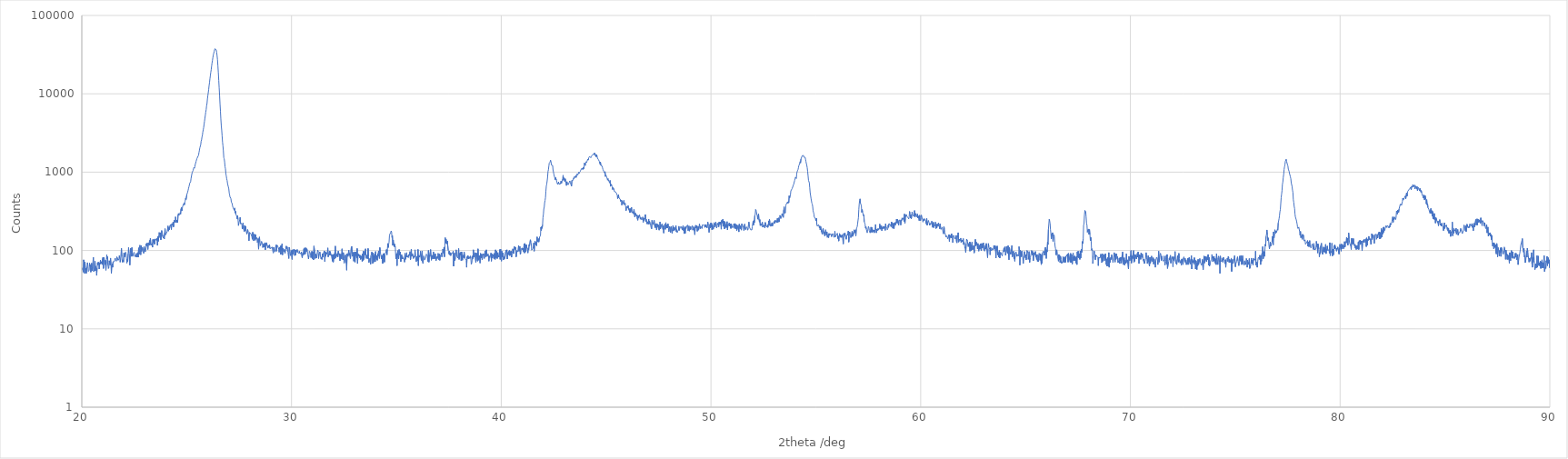
| Category | [Measurement conditions] |
|---|---|
| 20.01 | 56 |
| 20.03 | 60 |
| 20.05 | 58 |
| 20.07 | 53 |
| 20.09 | 76 |
| 20.11 | 71 |
| 20.13 | 51 |
| 20.15 | 71 |
| 20.17 | 57 |
| 20.19 | 59 |
| 20.21 | 51 |
| 20.23 | 50 |
| 20.25 | 62 |
| 20.27 | 70 |
| 20.29 | 64 |
| 20.31 | 54 |
| 20.33 | 53 |
| 20.35 | 56 |
| 20.37 | 69 |
| 20.39 | 63 |
| 20.41 | 65 |
| 20.43 | 53 |
| 20.45 | 60 |
| 20.47 | 69 |
| 20.49 | 55 |
| 20.51 | 61 |
| 20.53 | 60 |
| 20.55 | 82 |
| 20.57 | 54 |
| 20.59 | 57 |
| 20.61 | 60 |
| 20.63 | 73 |
| 20.65 | 55 |
| 20.67 | 63 |
| 20.69 | 56 |
| 20.71 | 48 |
| 20.73 | 60 |
| 20.75 | 70 |
| 20.77 | 65 |
| 20.79 | 71 |
| 20.81 | 66 |
| 20.83 | 58 |
| 20.85 | 69 |
| 20.87 | 67 |
| 20.89 | 75 |
| 20.91 | 68 |
| 20.93 | 72 |
| 20.95 | 70 |
| 20.97 | 66 |
| 20.99 | 79 |
| 21.01 | 82 |
| 21.03 | 59 |
| 21.05 | 82 |
| 21.07 | 78 |
| 21.09 | 72 |
| 21.11 | 66 |
| 21.13 | 75 |
| 21.15 | 56 |
| 21.17 | 73 |
| 21.19 | 88 |
| 21.21 | 78 |
| 21.23 | 83 |
| 21.25 | 65 |
| 21.27 | 59 |
| 21.29 | 61 |
| 21.31 | 74 |
| 21.33 | 69 |
| 21.35 | 65 |
| 21.37 | 80 |
| 21.39 | 67 |
| 21.41 | 51 |
| 21.43 | 66 |
| 21.45 | 68 |
| 21.47 | 61 |
| 21.49 | 72 |
| 21.51 | 73 |
| 21.53 | 71 |
| 21.55 | 72 |
| 21.57 | 73 |
| 21.59 | 80 |
| 21.61 | 77 |
| 21.63 | 79 |
| 21.65 | 73 |
| 21.67 | 83 |
| 21.69 | 83 |
| 21.71 | 83 |
| 21.73 | 75 |
| 21.75 | 77 |
| 21.77 | 78 |
| 21.79 | 86 |
| 21.81 | 79 |
| 21.83 | 71 |
| 21.85 | 77 |
| 21.87 | 78 |
| 21.89 | 107 |
| 21.91 | 83 |
| 21.93 | 71 |
| 21.95 | 76 |
| 21.97 | 78 |
| 21.99 | 71 |
| 22.01 | 93 |
| 22.03 | 82 |
| 22.05 | 80 |
| 22.07 | 84 |
| 22.09 | 95 |
| 22.11 | 91 |
| 22.13 | 91 |
| 22.15 | 69 |
| 22.17 | 77 |
| 22.19 | 72 |
| 22.21 | 91 |
| 22.23 | 109 |
| 22.25 | 93 |
| 22.27 | 88 |
| 22.29 | 65 |
| 22.31 | 91 |
| 22.33 | 107 |
| 22.35 | 92 |
| 22.37 | 84 |
| 22.39 | 109 |
| 22.41 | 87 |
| 22.43 | 84 |
| 22.45 | 89 |
| 22.47 | 90 |
| 22.49 | 95 |
| 22.51 | 90 |
| 22.53 | 84 |
| 22.55 | 87 |
| 22.57 | 83 |
| 22.59 | 87 |
| 22.61 | 92 |
| 22.63 | 82 |
| 22.65 | 83 |
| 22.67 | 94 |
| 22.69 | 82 |
| 22.71 | 108 |
| 22.73 | 89 |
| 22.75 | 106 |
| 22.77 | 117 |
| 22.79 | 103 |
| 22.81 | 88 |
| 22.83 | 116 |
| 22.85 | 97 |
| 22.87 | 106 |
| 22.89 | 110 |
| 22.91 | 101 |
| 22.93 | 98 |
| 22.95 | 92 |
| 22.97 | 113 |
| 22.99 | 111 |
| 23.01 | 99 |
| 23.03 | 96 |
| 23.05 | 100 |
| 23.07 | 122 |
| 23.09 | 115 |
| 23.11 | 124 |
| 23.13 | 113 |
| 23.15 | 103 |
| 23.17 | 125 |
| 23.19 | 121 |
| 23.21 | 116 |
| 23.23 | 134 |
| 23.25 | 118 |
| 23.27 | 143 |
| 23.29 | 124 |
| 23.31 | 116 |
| 23.33 | 116 |
| 23.35 | 124 |
| 23.37 | 110 |
| 23.39 | 138 |
| 23.41 | 126 |
| 23.43 | 126 |
| 23.45 | 138 |
| 23.47 | 120 |
| 23.49 | 137 |
| 23.51 | 141 |
| 23.53 | 143 |
| 23.55 | 143 |
| 23.57 | 133 |
| 23.59 | 144 |
| 23.61 | 116 |
| 23.63 | 151 |
| 23.65 | 131 |
| 23.67 | 154 |
| 23.69 | 170 |
| 23.71 | 160 |
| 23.73 | 146 |
| 23.75 | 169 |
| 23.77 | 137 |
| 23.79 | 163 |
| 23.81 | 180 |
| 23.83 | 164 |
| 23.85 | 151 |
| 23.87 | 152 |
| 23.89 | 144 |
| 23.91 | 158 |
| 23.93 | 140 |
| 23.95 | 169 |
| 23.97 | 190 |
| 23.99 | 158 |
| 24.01 | 159 |
| 24.03 | 165 |
| 24.05 | 163 |
| 24.07 | 174 |
| 24.09 | 170 |
| 24.11 | 206 |
| 24.13 | 177 |
| 24.15 | 195 |
| 24.17 | 184 |
| 24.19 | 182 |
| 24.21 | 208 |
| 24.23 | 215 |
| 24.25 | 206 |
| 24.27 | 185 |
| 24.29 | 218 |
| 24.31 | 212 |
| 24.33 | 216 |
| 24.35 | 230 |
| 24.37 | 200 |
| 24.39 | 219 |
| 24.41 | 244 |
| 24.43 | 229 |
| 24.45 | 238 |
| 24.47 | 269 |
| 24.49 | 272 |
| 24.51 | 227 |
| 24.53 | 244 |
| 24.55 | 239 |
| 24.57 | 228 |
| 24.59 | 286 |
| 24.61 | 297 |
| 24.63 | 280 |
| 24.65 | 282 |
| 24.67 | 294 |
| 24.69 | 305 |
| 24.71 | 290 |
| 24.73 | 339 |
| 24.75 | 354 |
| 24.77 | 321 |
| 24.79 | 343 |
| 24.81 | 367 |
| 24.83 | 376 |
| 24.85 | 375 |
| 24.87 | 401 |
| 24.89 | 381 |
| 24.91 | 411 |
| 24.93 | 428 |
| 24.95 | 465 |
| 24.97 | 447 |
| 24.99 | 440 |
| 25.01 | 519 |
| 25.03 | 512 |
| 25.05 | 559 |
| 25.07 | 589 |
| 25.09 | 622 |
| 25.11 | 653 |
| 25.13 | 663 |
| 25.15 | 726 |
| 25.17 | 732 |
| 25.19 | 758 |
| 25.21 | 834 |
| 25.23 | 838 |
| 25.25 | 958 |
| 25.27 | 1001 |
| 25.29 | 1011 |
| 25.31 | 1055 |
| 25.33 | 1118 |
| 25.35 | 1152 |
| 25.37 | 1120 |
| 25.39 | 1174 |
| 25.41 | 1254 |
| 25.43 | 1287 |
| 25.45 | 1374 |
| 25.47 | 1405 |
| 25.49 | 1493 |
| 25.51 | 1472 |
| 25.53 | 1470 |
| 25.55 | 1608 |
| 25.57 | 1669 |
| 25.59 | 1797 |
| 25.61 | 1912 |
| 25.63 | 2054 |
| 25.65 | 2056 |
| 25.67 | 2243 |
| 25.69 | 2484 |
| 25.71 | 2581 |
| 25.73 | 2807 |
| 25.75 | 2959 |
| 25.77 | 3244 |
| 25.79 | 3467 |
| 25.81 | 3700 |
| 25.83 | 4065 |
| 25.85 | 4440 |
| 25.87 | 4876 |
| 25.89 | 5326 |
| 25.91 | 5829 |
| 25.93 | 6266 |
| 25.95 | 7013 |
| 25.97 | 7493 |
| 25.99 | 8582 |
| 26.01 | 9478 |
| 26.03 | 10321 |
| 26.05 | 11384 |
| 26.07 | 12750 |
| 26.09 | 13945 |
| 26.11 | 15545 |
| 26.13 | 17055 |
| 26.15 | 18775 |
| 26.17 | 20361 |
| 26.19 | 22620 |
| 26.21 | 24729 |
| 26.23 | 26767 |
| 26.25 | 29030 |
| 26.27 | 31393 |
| 26.29 | 32784 |
| 26.31 | 34605 |
| 26.33 | 36295 |
| 26.35 | 37616 |
| 26.37 | 37832 |
| 26.39 | 37295 |
| 26.41 | 36249 |
| 26.43 | 33955 |
| 26.45 | 30811 |
| 26.47 | 27228 |
| 26.49 | 22786 |
| 26.51 | 18689 |
| 26.53 | 14809 |
| 26.55 | 11879 |
| 26.57 | 9483 |
| 26.59 | 7453 |
| 26.61 | 6016 |
| 26.63 | 4771 |
| 26.65 | 3933 |
| 26.67 | 3448 |
| 26.69 | 2896 |
| 26.71 | 2422 |
| 26.73 | 2159 |
| 26.75 | 1873 |
| 26.77 | 1535 |
| 26.79 | 1480 |
| 26.81 | 1350 |
| 26.83 | 1175 |
| 26.85 | 1103 |
| 26.87 | 954 |
| 26.89 | 892 |
| 26.91 | 821 |
| 26.93 | 781 |
| 26.95 | 712 |
| 26.97 | 697 |
| 26.99 | 644 |
| 27.01 | 610 |
| 27.03 | 541 |
| 27.05 | 508 |
| 27.07 | 480 |
| 27.09 | 492 |
| 27.11 | 458 |
| 27.13 | 416 |
| 27.15 | 418 |
| 27.17 | 396 |
| 27.19 | 368 |
| 27.21 | 354 |
| 27.23 | 353 |
| 27.25 | 351 |
| 27.27 | 326 |
| 27.29 | 349 |
| 27.31 | 302 |
| 27.33 | 316 |
| 27.35 | 289 |
| 27.37 | 285 |
| 27.39 | 273 |
| 27.41 | 253 |
| 27.43 | 278 |
| 27.45 | 248 |
| 27.47 | 208 |
| 27.49 | 224 |
| 27.51 | 224 |
| 27.53 | 246 |
| 27.55 | 265 |
| 27.57 | 219 |
| 27.59 | 224 |
| 27.61 | 219 |
| 27.63 | 222 |
| 27.65 | 189 |
| 27.67 | 204 |
| 27.69 | 225 |
| 27.71 | 189 |
| 27.73 | 181 |
| 27.75 | 174 |
| 27.77 | 208 |
| 27.79 | 178 |
| 27.81 | 204 |
| 27.83 | 185 |
| 27.85 | 170 |
| 27.87 | 162 |
| 27.89 | 175 |
| 27.91 | 185 |
| 27.93 | 171 |
| 27.95 | 163 |
| 27.97 | 133 |
| 27.99 | 170 |
| 28.01 | 167 |
| 28.03 | 168 |
| 28.05 | 166 |
| 28.07 | 168 |
| 28.09 | 162 |
| 28.11 | 150 |
| 28.13 | 139 |
| 28.15 | 171 |
| 28.17 | 154 |
| 28.19 | 133 |
| 28.21 | 149 |
| 28.23 | 162 |
| 28.25 | 146 |
| 28.27 | 135 |
| 28.29 | 159 |
| 28.31 | 140 |
| 28.33 | 137 |
| 28.35 | 146 |
| 28.37 | 127 |
| 28.39 | 131 |
| 28.41 | 142 |
| 28.43 | 104 |
| 28.45 | 141 |
| 28.47 | 149 |
| 28.49 | 127 |
| 28.51 | 115 |
| 28.53 | 112 |
| 28.55 | 124 |
| 28.57 | 131 |
| 28.59 | 132 |
| 28.61 | 123 |
| 28.63 | 109 |
| 28.65 | 116 |
| 28.67 | 122 |
| 28.69 | 110 |
| 28.71 | 120 |
| 28.73 | 126 |
| 28.75 | 102 |
| 28.77 | 123 |
| 28.79 | 115 |
| 28.81 | 126 |
| 28.83 | 119 |
| 28.85 | 115 |
| 28.87 | 107 |
| 28.89 | 116 |
| 28.91 | 117 |
| 28.93 | 109 |
| 28.95 | 119 |
| 28.97 | 106 |
| 28.99 | 108 |
| 29.01 | 106 |
| 29.03 | 107 |
| 29.05 | 106 |
| 29.07 | 111 |
| 29.09 | 114 |
| 29.11 | 110 |
| 29.13 | 93 |
| 29.15 | 110 |
| 29.17 | 104 |
| 29.19 | 100 |
| 29.21 | 96 |
| 29.23 | 103 |
| 29.25 | 114 |
| 29.27 | 118 |
| 29.29 | 98 |
| 29.31 | 117 |
| 29.33 | 115 |
| 29.35 | 112 |
| 29.37 | 109 |
| 29.39 | 104 |
| 29.41 | 95 |
| 29.43 | 110 |
| 29.45 | 101 |
| 29.47 | 114 |
| 29.49 | 89 |
| 29.51 | 115 |
| 29.53 | 100 |
| 29.55 | 122 |
| 29.57 | 88 |
| 29.59 | 107 |
| 29.61 | 105 |
| 29.63 | 99 |
| 29.65 | 96 |
| 29.67 | 103 |
| 29.69 | 92 |
| 29.71 | 102 |
| 29.73 | 110 |
| 29.75 | 114 |
| 29.77 | 105 |
| 29.79 | 111 |
| 29.81 | 99 |
| 29.83 | 95 |
| 29.85 | 94 |
| 29.87 | 79 |
| 29.89 | 110 |
| 29.91 | 105 |
| 29.93 | 97 |
| 29.95 | 86 |
| 29.97 | 90 |
| 29.99 | 100 |
| 30.01 | 98 |
| 30.03 | 77 |
| 30.05 | 102 |
| 30.07 | 90 |
| 30.09 | 99 |
| 30.11 | 104 |
| 30.13 | 99 |
| 30.15 | 86 |
| 30.17 | 102 |
| 30.19 | 87 |
| 30.21 | 101 |
| 30.23 | 95 |
| 30.25 | 98 |
| 30.27 | 103 |
| 30.29 | 95 |
| 30.31 | 94 |
| 30.33 | 96 |
| 30.35 | 92 |
| 30.37 | 98 |
| 30.39 | 92 |
| 30.41 | 92 |
| 30.43 | 94 |
| 30.45 | 91 |
| 30.47 | 96 |
| 30.49 | 98 |
| 30.51 | 81 |
| 30.53 | 90 |
| 30.55 | 94 |
| 30.57 | 88 |
| 30.59 | 105 |
| 30.61 | 90 |
| 30.63 | 108 |
| 30.65 | 90 |
| 30.67 | 92 |
| 30.69 | 108 |
| 30.71 | 97 |
| 30.73 | 105 |
| 30.75 | 100 |
| 30.77 | 90 |
| 30.79 | 90 |
| 30.81 | 78 |
| 30.83 | 86 |
| 30.85 | 98 |
| 30.87 | 99 |
| 30.89 | 93 |
| 30.91 | 87 |
| 30.93 | 81 |
| 30.95 | 93 |
| 30.97 | 98 |
| 30.99 | 79 |
| 31.01 | 96 |
| 31.03 | 95 |
| 31.05 | 76 |
| 31.07 | 114 |
| 31.09 | 111 |
| 31.11 | 92 |
| 31.13 | 79 |
| 31.15 | 90 |
| 31.17 | 87 |
| 31.19 | 80 |
| 31.21 | 86 |
| 31.23 | 95 |
| 31.25 | 101 |
| 31.27 | 97 |
| 31.29 | 79 |
| 31.31 | 90 |
| 31.33 | 90 |
| 31.35 | 96 |
| 31.37 | 87 |
| 31.39 | 89 |
| 31.41 | 78 |
| 31.43 | 82 |
| 31.45 | 77 |
| 31.47 | 91 |
| 31.49 | 82 |
| 31.51 | 91 |
| 31.53 | 93 |
| 31.55 | 90 |
| 31.57 | 99 |
| 31.59 | 72 |
| 31.61 | 96 |
| 31.63 | 84 |
| 31.65 | 94 |
| 31.67 | 89 |
| 31.69 | 92 |
| 31.71 | 97 |
| 31.73 | 108 |
| 31.75 | 83 |
| 31.77 | 88 |
| 31.79 | 93 |
| 31.81 | 98 |
| 31.83 | 87 |
| 31.85 | 97 |
| 31.87 | 89 |
| 31.89 | 86 |
| 31.91 | 89 |
| 31.93 | 91 |
| 31.95 | 73 |
| 31.97 | 89 |
| 31.99 | 71 |
| 32.01 | 78 |
| 32.03 | 90 |
| 32.05 | 78 |
| 32.07 | 97 |
| 32.09 | 114 |
| 32.11 | 81 |
| 32.13 | 80 |
| 32.15 | 80 |
| 32.17 | 89 |
| 32.19 | 92 |
| 32.21 | 83 |
| 32.23 | 98 |
| 32.25 | 100 |
| 32.27 | 88 |
| 32.29 | 91 |
| 32.31 | 74 |
| 32.33 | 73 |
| 32.35 | 90 |
| 32.37 | 81 |
| 32.39 | 78 |
| 32.41 | 105 |
| 32.43 | 88 |
| 32.45 | 76 |
| 32.47 | 94 |
| 32.49 | 80 |
| 32.51 | 69 |
| 32.53 | 79 |
| 32.55 | 78 |
| 32.57 | 88 |
| 32.59 | 70 |
| 32.61 | 68 |
| 32.63 | 56 |
| 32.65 | 91 |
| 32.67 | 92 |
| 32.69 | 84 |
| 32.71 | 93 |
| 32.73 | 101 |
| 32.75 | 87 |
| 32.77 | 92 |
| 32.79 | 92 |
| 32.81 | 79 |
| 32.83 | 80 |
| 32.85 | 109 |
| 32.87 | 113 |
| 32.89 | 94 |
| 32.91 | 84 |
| 32.93 | 89 |
| 32.95 | 95 |
| 32.97 | 73 |
| 32.99 | 92 |
| 33.01 | 96 |
| 33.03 | 71 |
| 33.05 | 96 |
| 33.07 | 86 |
| 33.09 | 91 |
| 33.11 | 81 |
| 33.13 | 106 |
| 33.15 | 68 |
| 33.17 | 91 |
| 33.19 | 92 |
| 33.21 | 85 |
| 33.23 | 88 |
| 33.25 | 81 |
| 33.27 | 87 |
| 33.29 | 77 |
| 33.31 | 81 |
| 33.33 | 85 |
| 33.35 | 78 |
| 33.37 | 72 |
| 33.39 | 91 |
| 33.41 | 74 |
| 33.43 | 98 |
| 33.45 | 77 |
| 33.47 | 83 |
| 33.49 | 97 |
| 33.51 | 88 |
| 33.53 | 105 |
| 33.55 | 87 |
| 33.57 | 79 |
| 33.59 | 87 |
| 33.61 | 88 |
| 33.63 | 79 |
| 33.65 | 106 |
| 33.67 | 83 |
| 33.69 | 70 |
| 33.71 | 76 |
| 33.73 | 76 |
| 33.75 | 80 |
| 33.77 | 67 |
| 33.79 | 86 |
| 33.81 | 85 |
| 33.83 | 96 |
| 33.85 | 87 |
| 33.87 | 68 |
| 33.89 | 93 |
| 33.91 | 71 |
| 33.93 | 86 |
| 33.95 | 76 |
| 33.97 | 91 |
| 33.99 | 72 |
| 34.01 | 97 |
| 34.03 | 80 |
| 34.05 | 77 |
| 34.07 | 86 |
| 34.09 | 75 |
| 34.11 | 91 |
| 34.13 | 84 |
| 34.15 | 99 |
| 34.17 | 89 |
| 34.19 | 79 |
| 34.21 | 109 |
| 34.23 | 97 |
| 34.25 | 99 |
| 34.27 | 99 |
| 34.29 | 78 |
| 34.31 | 87 |
| 34.33 | 89 |
| 34.35 | 68 |
| 34.37 | 91 |
| 34.39 | 88 |
| 34.41 | 92 |
| 34.43 | 71 |
| 34.45 | 88 |
| 34.47 | 90 |
| 34.49 | 93 |
| 34.51 | 93 |
| 34.53 | 103 |
| 34.55 | 88 |
| 34.57 | 103 |
| 34.59 | 123 |
| 34.61 | 109 |
| 34.63 | 120 |
| 34.65 | 127 |
| 34.67 | 155 |
| 34.69 | 162 |
| 34.71 | 166 |
| 34.73 | 171 |
| 34.75 | 178 |
| 34.77 | 173 |
| 34.79 | 147 |
| 34.81 | 154 |
| 34.83 | 116 |
| 34.85 | 136 |
| 34.87 | 120 |
| 34.89 | 112 |
| 34.91 | 121 |
| 34.93 | 120 |
| 34.95 | 110 |
| 34.97 | 83 |
| 34.99 | 78 |
| 35.01 | 91 |
| 35.03 | 64 |
| 35.05 | 94 |
| 35.07 | 100 |
| 35.09 | 81 |
| 35.11 | 78 |
| 35.13 | 103 |
| 35.15 | 88 |
| 35.17 | 87 |
| 35.19 | 96 |
| 35.21 | 72 |
| 35.23 | 73 |
| 35.25 | 88 |
| 35.27 | 78 |
| 35.29 | 83 |
| 35.31 | 79 |
| 35.33 | 81 |
| 35.35 | 80 |
| 35.37 | 78 |
| 35.39 | 71 |
| 35.41 | 92 |
| 35.43 | 77 |
| 35.45 | 82 |
| 35.47 | 90 |
| 35.49 | 94 |
| 35.51 | 82 |
| 35.53 | 85 |
| 35.55 | 87 |
| 35.57 | 81 |
| 35.59 | 89 |
| 35.61 | 86 |
| 35.63 | 84 |
| 35.65 | 97 |
| 35.67 | 76 |
| 35.69 | 81 |
| 35.71 | 104 |
| 35.73 | 84 |
| 35.75 | 83 |
| 35.77 | 91 |
| 35.79 | 87 |
| 35.81 | 79 |
| 35.83 | 85 |
| 35.85 | 86 |
| 35.87 | 82 |
| 35.89 | 102 |
| 35.91 | 83 |
| 35.93 | 83 |
| 35.95 | 72 |
| 35.97 | 84 |
| 35.99 | 82 |
| 36.01 | 74 |
| 36.03 | 103 |
| 36.05 | 64 |
| 36.07 | 87 |
| 36.09 | 89 |
| 36.11 | 82 |
| 36.13 | 85 |
| 36.15 | 98 |
| 36.17 | 98 |
| 36.19 | 75 |
| 36.21 | 88 |
| 36.23 | 99 |
| 36.25 | 71 |
| 36.27 | 68 |
| 36.29 | 79 |
| 36.31 | 85 |
| 36.33 | 79 |
| 36.35 | 76 |
| 36.37 | 77 |
| 36.39 | 80 |
| 36.41 | 84 |
| 36.43 | 90 |
| 36.45 | 92 |
| 36.47 | 87 |
| 36.49 | 80 |
| 36.51 | 72 |
| 36.53 | 100 |
| 36.55 | 71 |
| 36.57 | 87 |
| 36.59 | 84 |
| 36.61 | 95 |
| 36.63 | 103 |
| 36.65 | 84 |
| 36.67 | 75 |
| 36.69 | 87 |
| 36.71 | 81 |
| 36.73 | 78 |
| 36.75 | 86 |
| 36.77 | 96 |
| 36.79 | 78 |
| 36.81 | 86 |
| 36.83 | 79 |
| 36.85 | 91 |
| 36.87 | 88 |
| 36.89 | 74 |
| 36.91 | 79 |
| 36.93 | 83 |
| 36.95 | 79 |
| 36.97 | 85 |
| 36.99 | 92 |
| 37.01 | 88 |
| 37.03 | 76 |
| 37.05 | 90 |
| 37.07 | 75 |
| 37.09 | 84 |
| 37.11 | 87 |
| 37.13 | 87 |
| 37.15 | 93 |
| 37.17 | 83 |
| 37.19 | 87 |
| 37.21 | 104 |
| 37.23 | 101 |
| 37.25 | 92 |
| 37.27 | 110 |
| 37.29 | 83 |
| 37.31 | 114 |
| 37.33 | 146 |
| 37.35 | 124 |
| 37.37 | 139 |
| 37.39 | 131 |
| 37.41 | 121 |
| 37.43 | 132 |
| 37.45 | 129 |
| 37.47 | 101 |
| 37.49 | 97 |
| 37.51 | 90 |
| 37.53 | 98 |
| 37.55 | 88 |
| 37.57 | 94 |
| 37.59 | 86 |
| 37.61 | 92 |
| 37.63 | 92 |
| 37.65 | 93 |
| 37.67 | 92 |
| 37.69 | 90 |
| 37.71 | 98 |
| 37.73 | 63 |
| 37.75 | 75 |
| 37.77 | 93 |
| 37.79 | 74 |
| 37.81 | 81 |
| 37.83 | 91 |
| 37.85 | 102 |
| 37.87 | 89 |
| 37.89 | 83 |
| 37.91 | 83 |
| 37.93 | 80 |
| 37.95 | 95 |
| 37.97 | 106 |
| 37.99 | 77 |
| 38.01 | 92 |
| 38.03 | 87 |
| 38.05 | 89 |
| 38.07 | 95 |
| 38.09 | 74 |
| 38.11 | 96 |
| 38.13 | 93 |
| 38.15 | 75 |
| 38.17 | 83 |
| 38.19 | 87 |
| 38.21 | 81 |
| 38.23 | 96 |
| 38.25 | 95 |
| 38.27 | 79 |
| 38.29 | 78 |
| 38.31 | 80 |
| 38.33 | 75 |
| 38.35 | 61 |
| 38.37 | 83 |
| 38.39 | 79 |
| 38.41 | 86 |
| 38.43 | 84 |
| 38.45 | 78 |
| 38.47 | 83 |
| 38.49 | 85 |
| 38.51 | 79 |
| 38.53 | 85 |
| 38.55 | 80 |
| 38.57 | 67 |
| 38.59 | 69 |
| 38.61 | 74 |
| 38.63 | 85 |
| 38.65 | 79 |
| 38.67 | 102 |
| 38.69 | 82 |
| 38.71 | 85 |
| 38.73 | 85 |
| 38.75 | 94 |
| 38.77 | 93 |
| 38.79 | 70 |
| 38.81 | 93 |
| 38.83 | 89 |
| 38.85 | 76 |
| 38.87 | 73 |
| 38.89 | 105 |
| 38.91 | 82 |
| 38.93 | 75 |
| 38.95 | 86 |
| 38.97 | 78 |
| 38.99 | 69 |
| 39.01 | 92 |
| 39.03 | 92 |
| 39.05 | 81 |
| 39.07 | 90 |
| 39.09 | 76 |
| 39.11 | 84 |
| 39.13 | 82 |
| 39.15 | 91 |
| 39.17 | 86 |
| 39.19 | 79 |
| 39.21 | 78 |
| 39.23 | 98 |
| 39.25 | 89 |
| 39.27 | 83 |
| 39.29 | 102 |
| 39.31 | 89 |
| 39.33 | 84 |
| 39.35 | 88 |
| 39.37 | 91 |
| 39.39 | 88 |
| 39.41 | 73 |
| 39.43 | 85 |
| 39.45 | 81 |
| 39.47 | 82 |
| 39.49 | 86 |
| 39.51 | 93 |
| 39.53 | 73 |
| 39.55 | 91 |
| 39.57 | 80 |
| 39.59 | 83 |
| 39.61 | 81 |
| 39.63 | 89 |
| 39.65 | 79 |
| 39.67 | 92 |
| 39.69 | 92 |
| 39.71 | 77 |
| 39.73 | 102 |
| 39.75 | 81 |
| 39.77 | 98 |
| 39.79 | 97 |
| 39.81 | 79 |
| 39.83 | 94 |
| 39.85 | 82 |
| 39.87 | 86 |
| 39.89 | 82 |
| 39.91 | 95 |
| 39.93 | 103 |
| 39.95 | 77 |
| 39.97 | 104 |
| 39.99 | 85 |
| 40.01 | 73 |
| 40.03 | 98 |
| 40.05 | 83 |
| 40.07 | 85 |
| 40.09 | 93 |
| 40.11 | 76 |
| 40.13 | 74 |
| 40.15 | 83 |
| 40.17 | 79 |
| 40.19 | 77 |
| 40.21 | 96 |
| 40.23 | 101 |
| 40.25 | 96 |
| 40.27 | 102 |
| 40.29 | 78 |
| 40.31 | 94 |
| 40.33 | 88 |
| 40.35 | 97 |
| 40.37 | 89 |
| 40.39 | 100 |
| 40.41 | 86 |
| 40.43 | 97 |
| 40.45 | 88 |
| 40.47 | 98 |
| 40.49 | 82 |
| 40.51 | 92 |
| 40.53 | 98 |
| 40.55 | 105 |
| 40.57 | 103 |
| 40.59 | 91 |
| 40.61 | 93 |
| 40.63 | 112 |
| 40.65 | 107 |
| 40.67 | 103 |
| 40.69 | 110 |
| 40.71 | 83 |
| 40.73 | 88 |
| 40.75 | 100 |
| 40.77 | 100 |
| 40.79 | 96 |
| 40.81 | 107 |
| 40.83 | 116 |
| 40.85 | 98 |
| 40.87 | 110 |
| 40.89 | 113 |
| 40.91 | 89 |
| 40.93 | 93 |
| 40.95 | 105 |
| 40.97 | 105 |
| 40.99 | 108 |
| 41.01 | 102 |
| 41.03 | 107 |
| 41.05 | 105 |
| 41.07 | 96 |
| 41.09 | 122 |
| 41.11 | 93 |
| 41.13 | 123 |
| 41.15 | 120 |
| 41.17 | 96 |
| 41.19 | 119 |
| 41.21 | 121 |
| 41.23 | 107 |
| 41.25 | 108 |
| 41.27 | 93 |
| 41.29 | 107 |
| 41.31 | 102 |
| 41.33 | 119 |
| 41.35 | 115 |
| 41.37 | 118 |
| 41.39 | 137 |
| 41.41 | 129 |
| 41.43 | 123 |
| 41.45 | 101 |
| 41.47 | 102 |
| 41.49 | 101 |
| 41.51 | 106 |
| 41.53 | 113 |
| 41.55 | 125 |
| 41.57 | 98 |
| 41.59 | 115 |
| 41.61 | 132 |
| 41.63 | 131 |
| 41.65 | 118 |
| 41.67 | 127 |
| 41.69 | 115 |
| 41.71 | 149 |
| 41.73 | 129 |
| 41.75 | 138 |
| 41.77 | 142 |
| 41.79 | 128 |
| 41.81 | 130 |
| 41.83 | 149 |
| 41.85 | 147 |
| 41.87 | 155 |
| 41.89 | 198 |
| 41.91 | 180 |
| 41.93 | 202 |
| 41.95 | 192 |
| 41.97 | 213 |
| 41.99 | 263 |
| 42.01 | 289 |
| 42.03 | 338 |
| 42.05 | 357 |
| 42.07 | 407 |
| 42.09 | 435 |
| 42.11 | 472 |
| 42.13 | 574 |
| 42.15 | 666 |
| 42.17 | 705 |
| 42.19 | 774 |
| 42.21 | 862 |
| 42.23 | 1020 |
| 42.25 | 1073 |
| 42.27 | 1197 |
| 42.29 | 1304 |
| 42.31 | 1323 |
| 42.33 | 1349 |
| 42.35 | 1424 |
| 42.37 | 1373 |
| 42.39 | 1234 |
| 42.41 | 1241 |
| 42.43 | 1204 |
| 42.45 | 1217 |
| 42.47 | 1066 |
| 42.49 | 1057 |
| 42.51 | 940 |
| 42.53 | 941 |
| 42.55 | 853 |
| 42.57 | 802 |
| 42.59 | 853 |
| 42.61 | 845 |
| 42.63 | 792 |
| 42.65 | 742 |
| 42.67 | 738 |
| 42.69 | 697 |
| 42.71 | 710 |
| 42.73 | 753 |
| 42.75 | 707 |
| 42.77 | 721 |
| 42.79 | 705 |
| 42.81 | 702 |
| 42.83 | 742 |
| 42.85 | 769 |
| 42.87 | 719 |
| 42.89 | 745 |
| 42.91 | 792 |
| 42.93 | 826 |
| 42.95 | 913 |
| 42.97 | 788 |
| 42.99 | 844 |
| 43.01 | 808 |
| 43.03 | 759 |
| 43.05 | 823 |
| 43.07 | 770 |
| 43.09 | 780 |
| 43.11 | 674 |
| 43.13 | 756 |
| 43.15 | 718 |
| 43.17 | 709 |
| 43.19 | 690 |
| 43.21 | 687 |
| 43.23 | 707 |
| 43.25 | 748 |
| 43.27 | 774 |
| 43.29 | 747 |
| 43.31 | 729 |
| 43.33 | 751 |
| 43.35 | 661 |
| 43.37 | 785 |
| 43.39 | 777 |
| 43.41 | 801 |
| 43.43 | 789 |
| 43.45 | 845 |
| 43.47 | 820 |
| 43.49 | 878 |
| 43.51 | 852 |
| 43.53 | 851 |
| 43.55 | 901 |
| 43.57 | 854 |
| 43.59 | 920 |
| 43.61 | 948 |
| 43.63 | 951 |
| 43.65 | 914 |
| 43.67 | 960 |
| 43.69 | 998 |
| 43.71 | 958 |
| 43.73 | 990 |
| 43.75 | 1014 |
| 43.77 | 1022 |
| 43.79 | 1061 |
| 43.81 | 1083 |
| 43.83 | 1083 |
| 43.85 | 1126 |
| 43.87 | 1112 |
| 43.89 | 1072 |
| 43.91 | 1147 |
| 43.93 | 1104 |
| 43.95 | 1193 |
| 43.97 | 1311 |
| 43.99 | 1245 |
| 44.01 | 1209 |
| 44.03 | 1306 |
| 44.05 | 1363 |
| 44.07 | 1324 |
| 44.09 | 1375 |
| 44.11 | 1348 |
| 44.13 | 1468 |
| 44.15 | 1424 |
| 44.17 | 1522 |
| 44.19 | 1545 |
| 44.21 | 1587 |
| 44.23 | 1621 |
| 44.25 | 1627 |
| 44.27 | 1526 |
| 44.29 | 1587 |
| 44.31 | 1589 |
| 44.33 | 1617 |
| 44.35 | 1651 |
| 44.37 | 1696 |
| 44.39 | 1725 |
| 44.41 | 1674 |
| 44.43 | 1673 |
| 44.45 | 1766 |
| 44.47 | 1780 |
| 44.49 | 1624 |
| 44.51 | 1682 |
| 44.53 | 1568 |
| 44.55 | 1668 |
| 44.57 | 1583 |
| 44.59 | 1509 |
| 44.61 | 1522 |
| 44.63 | 1453 |
| 44.65 | 1449 |
| 44.67 | 1383 |
| 44.69 | 1358 |
| 44.71 | 1267 |
| 44.73 | 1344 |
| 44.75 | 1218 |
| 44.77 | 1215 |
| 44.79 | 1237 |
| 44.81 | 1198 |
| 44.83 | 1134 |
| 44.85 | 1082 |
| 44.87 | 1072 |
| 44.89 | 1021 |
| 44.91 | 1018 |
| 44.93 | 974 |
| 44.95 | 1015 |
| 44.97 | 879 |
| 44.99 | 915 |
| 45.01 | 904 |
| 45.03 | 871 |
| 45.05 | 883 |
| 45.07 | 790 |
| 45.09 | 827 |
| 45.11 | 798 |
| 45.13 | 766 |
| 45.15 | 770 |
| 45.17 | 728 |
| 45.19 | 785 |
| 45.21 | 658 |
| 45.23 | 673 |
| 45.25 | 701 |
| 45.27 | 718 |
| 45.29 | 652 |
| 45.31 | 599 |
| 45.33 | 635 |
| 45.35 | 627 |
| 45.37 | 618 |
| 45.39 | 568 |
| 45.41 | 557 |
| 45.43 | 560 |
| 45.45 | 560 |
| 45.47 | 566 |
| 45.49 | 539 |
| 45.51 | 548 |
| 45.53 | 510 |
| 45.55 | 460 |
| 45.57 | 497 |
| 45.59 | 516 |
| 45.61 | 467 |
| 45.63 | 473 |
| 45.65 | 468 |
| 45.67 | 455 |
| 45.69 | 422 |
| 45.71 | 414 |
| 45.73 | 440 |
| 45.75 | 379 |
| 45.77 | 432 |
| 45.79 | 409 |
| 45.81 | 413 |
| 45.83 | 393 |
| 45.85 | 436 |
| 45.87 | 383 |
| 45.89 | 378 |
| 45.91 | 402 |
| 45.93 | 371 |
| 45.95 | 322 |
| 45.97 | 344 |
| 45.99 | 365 |
| 46.01 | 365 |
| 46.03 | 348 |
| 46.05 | 375 |
| 46.07 | 335 |
| 46.09 | 326 |
| 46.11 | 341 |
| 46.13 | 305 |
| 46.15 | 342 |
| 46.17 | 307 |
| 46.19 | 310 |
| 46.21 | 356 |
| 46.23 | 316 |
| 46.25 | 302 |
| 46.27 | 315 |
| 46.29 | 302 |
| 46.31 | 293 |
| 46.33 | 335 |
| 46.35 | 334 |
| 46.37 | 268 |
| 46.39 | 301 |
| 46.41 | 300 |
| 46.43 | 309 |
| 46.45 | 275 |
| 46.47 | 286 |
| 46.49 | 253 |
| 46.51 | 243 |
| 46.53 | 278 |
| 46.55 | 260 |
| 46.57 | 263 |
| 46.59 | 285 |
| 46.61 | 275 |
| 46.63 | 251 |
| 46.65 | 264 |
| 46.67 | 250 |
| 46.69 | 246 |
| 46.71 | 245 |
| 46.73 | 250 |
| 46.75 | 268 |
| 46.77 | 229 |
| 46.79 | 256 |
| 46.81 | 243 |
| 46.83 | 260 |
| 46.85 | 253 |
| 46.87 | 288 |
| 46.89 | 236 |
| 46.91 | 251 |
| 46.93 | 256 |
| 46.95 | 219 |
| 46.97 | 233 |
| 46.99 | 224 |
| 47.01 | 216 |
| 47.03 | 252 |
| 47.05 | 218 |
| 47.07 | 237 |
| 47.09 | 243 |
| 47.11 | 223 |
| 47.13 | 205 |
| 47.15 | 195 |
| 47.17 | 189 |
| 47.19 | 243 |
| 47.21 | 226 |
| 47.23 | 222 |
| 47.25 | 215 |
| 47.27 | 235 |
| 47.29 | 244 |
| 47.31 | 210 |
| 47.33 | 196 |
| 47.35 | 215 |
| 47.37 | 197 |
| 47.39 | 221 |
| 47.41 | 183 |
| 47.43 | 201 |
| 47.45 | 217 |
| 47.47 | 201 |
| 47.49 | 212 |
| 47.51 | 211 |
| 47.53 | 182 |
| 47.55 | 203 |
| 47.57 | 232 |
| 47.59 | 189 |
| 47.61 | 193 |
| 47.63 | 210 |
| 47.65 | 214 |
| 47.67 | 220 |
| 47.69 | 192 |
| 47.71 | 186 |
| 47.73 | 207 |
| 47.75 | 167 |
| 47.77 | 195 |
| 47.79 | 218 |
| 47.81 | 212 |
| 47.83 | 186 |
| 47.85 | 227 |
| 47.87 | 193 |
| 47.89 | 211 |
| 47.91 | 202 |
| 47.93 | 193 |
| 47.95 | 219 |
| 47.97 | 197 |
| 47.99 | 174 |
| 48.01 | 181 |
| 48.03 | 203 |
| 48.05 | 191 |
| 48.07 | 169 |
| 48.09 | 196 |
| 48.11 | 203 |
| 48.13 | 204 |
| 48.15 | 165 |
| 48.17 | 185 |
| 48.19 | 209 |
| 48.21 | 178 |
| 48.23 | 188 |
| 48.25 | 199 |
| 48.27 | 182 |
| 48.29 | 179 |
| 48.31 | 194 |
| 48.33 | 209 |
| 48.35 | 174 |
| 48.37 | 184 |
| 48.39 | 170 |
| 48.41 | 175 |
| 48.43 | 176 |
| 48.45 | 182 |
| 48.47 | 204 |
| 48.49 | 181 |
| 48.51 | 192 |
| 48.53 | 195 |
| 48.55 | 194 |
| 48.57 | 203 |
| 48.59 | 202 |
| 48.61 | 199 |
| 48.63 | 184 |
| 48.65 | 199 |
| 48.67 | 208 |
| 48.69 | 180 |
| 48.71 | 191 |
| 48.73 | 164 |
| 48.75 | 200 |
| 48.77 | 165 |
| 48.79 | 198 |
| 48.81 | 191 |
| 48.83 | 204 |
| 48.85 | 204 |
| 48.87 | 204 |
| 48.89 | 211 |
| 48.91 | 179 |
| 48.93 | 192 |
| 48.95 | 206 |
| 48.97 | 177 |
| 48.99 | 188 |
| 49.01 | 202 |
| 49.03 | 185 |
| 49.05 | 194 |
| 49.07 | 196 |
| 49.09 | 198 |
| 49.11 | 208 |
| 49.13 | 182 |
| 49.15 | 188 |
| 49.17 | 201 |
| 49.19 | 204 |
| 49.21 | 176 |
| 49.23 | 159 |
| 49.25 | 199 |
| 49.27 | 210 |
| 49.29 | 193 |
| 49.31 | 202 |
| 49.33 | 208 |
| 49.35 | 176 |
| 49.37 | 189 |
| 49.39 | 203 |
| 49.41 | 182 |
| 49.43 | 199 |
| 49.45 | 218 |
| 49.47 | 216 |
| 49.49 | 190 |
| 49.51 | 203 |
| 49.53 | 200 |
| 49.55 | 197 |
| 49.57 | 191 |
| 49.59 | 211 |
| 49.61 | 206 |
| 49.63 | 207 |
| 49.65 | 212 |
| 49.67 | 212 |
| 49.69 | 206 |
| 49.71 | 197 |
| 49.73 | 215 |
| 49.75 | 216 |
| 49.77 | 199 |
| 49.79 | 205 |
| 49.81 | 194 |
| 49.83 | 214 |
| 49.85 | 231 |
| 49.87 | 209 |
| 49.89 | 205 |
| 49.91 | 170 |
| 49.93 | 197 |
| 49.95 | 216 |
| 49.97 | 195 |
| 49.99 | 224 |
| 50.01 | 198 |
| 50.03 | 223 |
| 50.05 | 184 |
| 50.07 | 212 |
| 50.09 | 212 |
| 50.11 | 187 |
| 50.13 | 204 |
| 50.15 | 227 |
| 50.17 | 210 |
| 50.19 | 200 |
| 50.21 | 221 |
| 50.23 | 232 |
| 50.25 | 206 |
| 50.27 | 194 |
| 50.29 | 202 |
| 50.31 | 222 |
| 50.33 | 214 |
| 50.35 | 223 |
| 50.37 | 201 |
| 50.39 | 231 |
| 50.41 | 237 |
| 50.43 | 214 |
| 50.45 | 232 |
| 50.47 | 215 |
| 50.49 | 187 |
| 50.51 | 242 |
| 50.53 | 225 |
| 50.55 | 224 |
| 50.57 | 251 |
| 50.59 | 203 |
| 50.61 | 199 |
| 50.63 | 238 |
| 50.65 | 189 |
| 50.67 | 231 |
| 50.69 | 208 |
| 50.71 | 215 |
| 50.73 | 196 |
| 50.75 | 218 |
| 50.77 | 234 |
| 50.79 | 183 |
| 50.81 | 214 |
| 50.83 | 208 |
| 50.85 | 204 |
| 50.87 | 225 |
| 50.89 | 204 |
| 50.91 | 220 |
| 50.93 | 218 |
| 50.95 | 191 |
| 50.97 | 218 |
| 50.99 | 216 |
| 51.01 | 197 |
| 51.03 | 198 |
| 51.05 | 202 |
| 51.07 | 198 |
| 51.09 | 219 |
| 51.11 | 201 |
| 51.13 | 191 |
| 51.15 | 221 |
| 51.17 | 209 |
| 51.19 | 189 |
| 51.21 | 214 |
| 51.23 | 179 |
| 51.25 | 179 |
| 51.27 | 200 |
| 51.29 | 210 |
| 51.31 | 208 |
| 51.33 | 173 |
| 51.35 | 217 |
| 51.37 | 203 |
| 51.39 | 190 |
| 51.41 | 206 |
| 51.43 | 189 |
| 51.45 | 182 |
| 51.47 | 219 |
| 51.49 | 221 |
| 51.51 | 208 |
| 51.53 | 211 |
| 51.55 | 194 |
| 51.57 | 180 |
| 51.59 | 177 |
| 51.61 | 217 |
| 51.63 | 216 |
| 51.65 | 185 |
| 51.67 | 194 |
| 51.69 | 199 |
| 51.71 | 200 |
| 51.73 | 198 |
| 51.75 | 182 |
| 51.77 | 191 |
| 51.79 | 216 |
| 51.81 | 231 |
| 51.83 | 200 |
| 51.85 | 195 |
| 51.87 | 203 |
| 51.89 | 184 |
| 51.91 | 182 |
| 51.93 | 180 |
| 51.95 | 183 |
| 51.97 | 201 |
| 51.99 | 220 |
| 52.01 | 236 |
| 52.03 | 211 |
| 52.05 | 244 |
| 52.07 | 227 |
| 52.09 | 279 |
| 52.11 | 287 |
| 52.13 | 333 |
| 52.15 | 324 |
| 52.17 | 317 |
| 52.19 | 325 |
| 52.21 | 274 |
| 52.23 | 251 |
| 52.25 | 281 |
| 52.27 | 293 |
| 52.29 | 246 |
| 52.31 | 231 |
| 52.33 | 248 |
| 52.35 | 208 |
| 52.37 | 218 |
| 52.39 | 208 |
| 52.41 | 215 |
| 52.43 | 213 |
| 52.45 | 230 |
| 52.47 | 198 |
| 52.49 | 202 |
| 52.51 | 211 |
| 52.53 | 207 |
| 52.55 | 210 |
| 52.57 | 194 |
| 52.59 | 228 |
| 52.61 | 206 |
| 52.63 | 208 |
| 52.65 | 207 |
| 52.67 | 198 |
| 52.69 | 212 |
| 52.71 | 197 |
| 52.73 | 205 |
| 52.75 | 239 |
| 52.77 | 208 |
| 52.79 | 249 |
| 52.81 | 228 |
| 52.83 | 228 |
| 52.85 | 203 |
| 52.87 | 207 |
| 52.89 | 219 |
| 52.91 | 227 |
| 52.93 | 205 |
| 52.95 | 213 |
| 52.97 | 214 |
| 52.99 | 215 |
| 53.01 | 235 |
| 53.03 | 220 |
| 53.05 | 242 |
| 53.07 | 229 |
| 53.09 | 230 |
| 53.11 | 243 |
| 53.13 | 238 |
| 53.15 | 227 |
| 53.17 | 257 |
| 53.19 | 229 |
| 53.21 | 243 |
| 53.23 | 261 |
| 53.25 | 232 |
| 53.27 | 253 |
| 53.29 | 281 |
| 53.31 | 280 |
| 53.33 | 256 |
| 53.35 | 252 |
| 53.37 | 274 |
| 53.39 | 296 |
| 53.41 | 278 |
| 53.43 | 283 |
| 53.45 | 264 |
| 53.47 | 328 |
| 53.49 | 361 |
| 53.51 | 313 |
| 53.53 | 298 |
| 53.55 | 314 |
| 53.57 | 372 |
| 53.59 | 390 |
| 53.61 | 394 |
| 53.63 | 395 |
| 53.65 | 416 |
| 53.67 | 399 |
| 53.69 | 421 |
| 53.71 | 407 |
| 53.73 | 498 |
| 53.75 | 467 |
| 53.77 | 480 |
| 53.79 | 515 |
| 53.81 | 577 |
| 53.83 | 567 |
| 53.85 | 576 |
| 53.87 | 617 |
| 53.89 | 602 |
| 53.91 | 661 |
| 53.93 | 671 |
| 53.95 | 707 |
| 53.97 | 709 |
| 53.99 | 780 |
| 54.01 | 815 |
| 54.03 | 864 |
| 54.05 | 885 |
| 54.07 | 828 |
| 54.09 | 953 |
| 54.11 | 1013 |
| 54.13 | 1045 |
| 54.15 | 1076 |
| 54.17 | 1135 |
| 54.19 | 1210 |
| 54.21 | 1245 |
| 54.23 | 1308 |
| 54.25 | 1363 |
| 54.27 | 1306 |
| 54.29 | 1468 |
| 54.31 | 1470 |
| 54.33 | 1504 |
| 54.35 | 1621 |
| 54.37 | 1662 |
| 54.39 | 1597 |
| 54.41 | 1633 |
| 54.43 | 1556 |
| 54.45 | 1593 |
| 54.47 | 1588 |
| 54.49 | 1546 |
| 54.51 | 1461 |
| 54.53 | 1367 |
| 54.55 | 1287 |
| 54.57 | 1222 |
| 54.59 | 1140 |
| 54.61 | 1020 |
| 54.63 | 905 |
| 54.65 | 787 |
| 54.67 | 773 |
| 54.69 | 731 |
| 54.71 | 637 |
| 54.73 | 547 |
| 54.75 | 505 |
| 54.77 | 464 |
| 54.79 | 456 |
| 54.81 | 403 |
| 54.83 | 391 |
| 54.85 | 365 |
| 54.87 | 322 |
| 54.89 | 306 |
| 54.91 | 293 |
| 54.93 | 266 |
| 54.95 | 262 |
| 54.97 | 258 |
| 54.99 | 263 |
| 55.01 | 239 |
| 55.03 | 258 |
| 55.05 | 213 |
| 55.07 | 204 |
| 55.09 | 206 |
| 55.11 | 203 |
| 55.13 | 214 |
| 55.15 | 210 |
| 55.17 | 195 |
| 55.19 | 205 |
| 55.21 | 183 |
| 55.23 | 202 |
| 55.25 | 198 |
| 55.27 | 173 |
| 55.29 | 171 |
| 55.31 | 160 |
| 55.33 | 185 |
| 55.35 | 192 |
| 55.37 | 170 |
| 55.39 | 162 |
| 55.41 | 174 |
| 55.43 | 152 |
| 55.45 | 163 |
| 55.47 | 184 |
| 55.49 | 187 |
| 55.51 | 157 |
| 55.53 | 172 |
| 55.55 | 147 |
| 55.57 | 151 |
| 55.59 | 159 |
| 55.61 | 146 |
| 55.63 | 165 |
| 55.65 | 157 |
| 55.67 | 161 |
| 55.69 | 160 |
| 55.71 | 164 |
| 55.73 | 164 |
| 55.75 | 150 |
| 55.77 | 162 |
| 55.79 | 161 |
| 55.81 | 158 |
| 55.83 | 163 |
| 55.85 | 153 |
| 55.87 | 147 |
| 55.89 | 153 |
| 55.91 | 176 |
| 55.93 | 149 |
| 55.95 | 148 |
| 55.97 | 151 |
| 55.99 | 159 |
| 56.01 | 155 |
| 56.03 | 166 |
| 56.05 | 142 |
| 56.07 | 153 |
| 56.09 | 132 |
| 56.11 | 138 |
| 56.13 | 165 |
| 56.15 | 152 |
| 56.17 | 158 |
| 56.19 | 147 |
| 56.21 | 154 |
| 56.23 | 147 |
| 56.25 | 159 |
| 56.27 | 151 |
| 56.29 | 154 |
| 56.31 | 121 |
| 56.33 | 165 |
| 56.35 | 167 |
| 56.37 | 157 |
| 56.39 | 168 |
| 56.41 | 151 |
| 56.43 | 148 |
| 56.45 | 139 |
| 56.47 | 154 |
| 56.49 | 150 |
| 56.51 | 161 |
| 56.53 | 156 |
| 56.55 | 177 |
| 56.57 | 128 |
| 56.59 | 148 |
| 56.61 | 173 |
| 56.63 | 165 |
| 56.65 | 157 |
| 56.67 | 146 |
| 56.69 | 157 |
| 56.71 | 155 |
| 56.73 | 176 |
| 56.75 | 151 |
| 56.77 | 165 |
| 56.79 | 159 |
| 56.81 | 174 |
| 56.83 | 184 |
| 56.85 | 168 |
| 56.87 | 173 |
| 56.89 | 182 |
| 56.91 | 154 |
| 56.93 | 187 |
| 56.95 | 194 |
| 56.97 | 200 |
| 56.99 | 216 |
| 57.01 | 239 |
| 57.03 | 261 |
| 57.05 | 332 |
| 57.07 | 394 |
| 57.09 | 439 |
| 57.11 | 456 |
| 57.13 | 399 |
| 57.15 | 392 |
| 57.17 | 375 |
| 57.19 | 307 |
| 57.21 | 333 |
| 57.23 | 310 |
| 57.25 | 295 |
| 57.27 | 278 |
| 57.29 | 286 |
| 57.31 | 233 |
| 57.33 | 234 |
| 57.35 | 217 |
| 57.37 | 194 |
| 57.39 | 201 |
| 57.41 | 186 |
| 57.43 | 189 |
| 57.45 | 168 |
| 57.47 | 175 |
| 57.49 | 189 |
| 57.51 | 203 |
| 57.53 | 197 |
| 57.55 | 180 |
| 57.57 | 177 |
| 57.59 | 168 |
| 57.61 | 182 |
| 57.63 | 199 |
| 57.65 | 172 |
| 57.67 | 197 |
| 57.69 | 169 |
| 57.71 | 175 |
| 57.73 | 184 |
| 57.75 | 174 |
| 57.77 | 182 |
| 57.79 | 168 |
| 57.81 | 173 |
| 57.83 | 170 |
| 57.85 | 215 |
| 57.87 | 182 |
| 57.89 | 168 |
| 57.91 | 186 |
| 57.93 | 178 |
| 57.95 | 182 |
| 57.97 | 192 |
| 57.99 | 182 |
| 58.01 | 183 |
| 58.03 | 193 |
| 58.05 | 218 |
| 58.07 | 187 |
| 58.09 | 206 |
| 58.11 | 188 |
| 58.13 | 206 |
| 58.15 | 179 |
| 58.17 | 196 |
| 58.19 | 188 |
| 58.21 | 187 |
| 58.23 | 204 |
| 58.25 | 192 |
| 58.27 | 201 |
| 58.29 | 199 |
| 58.31 | 181 |
| 58.33 | 219 |
| 58.35 | 200 |
| 58.37 | 197 |
| 58.39 | 191 |
| 58.41 | 184 |
| 58.43 | 189 |
| 58.45 | 210 |
| 58.47 | 197 |
| 58.49 | 220 |
| 58.51 | 218 |
| 58.53 | 223 |
| 58.55 | 215 |
| 58.57 | 216 |
| 58.59 | 201 |
| 58.61 | 232 |
| 58.63 | 214 |
| 58.65 | 222 |
| 58.67 | 192 |
| 58.69 | 217 |
| 58.71 | 224 |
| 58.73 | 190 |
| 58.75 | 221 |
| 58.77 | 228 |
| 58.79 | 210 |
| 58.81 | 228 |
| 58.83 | 235 |
| 58.85 | 252 |
| 58.87 | 224 |
| 58.89 | 250 |
| 58.91 | 245 |
| 58.93 | 250 |
| 58.95 | 211 |
| 58.97 | 244 |
| 58.99 | 240 |
| 59.01 | 245 |
| 59.03 | 243 |
| 59.05 | 211 |
| 59.07 | 246 |
| 59.09 | 239 |
| 59.11 | 260 |
| 59.13 | 248 |
| 59.15 | 250 |
| 59.17 | 261 |
| 59.19 | 259 |
| 59.21 | 235 |
| 59.23 | 292 |
| 59.25 | 222 |
| 59.27 | 257 |
| 59.29 | 263 |
| 59.31 | 288 |
| 59.33 | 277 |
| 59.35 | 273 |
| 59.37 | 275 |
| 59.39 | 263 |
| 59.41 | 269 |
| 59.43 | 253 |
| 59.45 | 270 |
| 59.47 | 315 |
| 59.49 | 294 |
| 59.51 | 261 |
| 59.53 | 286 |
| 59.55 | 254 |
| 59.57 | 270 |
| 59.59 | 312 |
| 59.61 | 284 |
| 59.63 | 277 |
| 59.65 | 277 |
| 59.67 | 272 |
| 59.69 | 273 |
| 59.71 | 324 |
| 59.73 | 268 |
| 59.75 | 279 |
| 59.77 | 297 |
| 59.79 | 282 |
| 59.81 | 286 |
| 59.83 | 267 |
| 59.85 | 292 |
| 59.87 | 260 |
| 59.89 | 275 |
| 59.91 | 255 |
| 59.93 | 240 |
| 59.95 | 282 |
| 59.97 | 261 |
| 59.99 | 240 |
| 60.01 | 257 |
| 60.03 | 283 |
| 60.05 | 269 |
| 60.07 | 265 |
| 60.09 | 250 |
| 60.11 | 231 |
| 60.13 | 253 |
| 60.15 | 250 |
| 60.17 | 239 |
| 60.19 | 255 |
| 60.21 | 257 |
| 60.23 | 242 |
| 60.25 | 242 |
| 60.27 | 218 |
| 60.29 | 256 |
| 60.31 | 210 |
| 60.33 | 225 |
| 60.35 | 225 |
| 60.37 | 242 |
| 60.39 | 237 |
| 60.41 | 236 |
| 60.43 | 209 |
| 60.45 | 223 |
| 60.47 | 219 |
| 60.49 | 217 |
| 60.51 | 223 |
| 60.53 | 237 |
| 60.55 | 209 |
| 60.57 | 197 |
| 60.59 | 193 |
| 60.61 | 229 |
| 60.63 | 196 |
| 60.65 | 214 |
| 60.67 | 213 |
| 60.69 | 206 |
| 60.71 | 230 |
| 60.73 | 191 |
| 60.75 | 215 |
| 60.77 | 195 |
| 60.79 | 218 |
| 60.81 | 210 |
| 60.83 | 203 |
| 60.85 | 224 |
| 60.87 | 217 |
| 60.89 | 213 |
| 60.91 | 189 |
| 60.93 | 219 |
| 60.95 | 195 |
| 60.97 | 186 |
| 60.99 | 190 |
| 61.01 | 185 |
| 61.03 | 199 |
| 61.05 | 180 |
| 61.07 | 179 |
| 61.09 | 163 |
| 61.11 | 201 |
| 61.13 | 190 |
| 61.15 | 171 |
| 61.17 | 163 |
| 61.19 | 161 |
| 61.21 | 148 |
| 61.23 | 147 |
| 61.25 | 154 |
| 61.27 | 156 |
| 61.29 | 141 |
| 61.31 | 142 |
| 61.33 | 151 |
| 61.35 | 160 |
| 61.37 | 130 |
| 61.39 | 157 |
| 61.41 | 159 |
| 61.43 | 155 |
| 61.45 | 144 |
| 61.47 | 164 |
| 61.49 | 165 |
| 61.51 | 145 |
| 61.53 | 126 |
| 61.55 | 143 |
| 61.57 | 156 |
| 61.59 | 150 |
| 61.61 | 153 |
| 61.63 | 150 |
| 61.65 | 140 |
| 61.67 | 140 |
| 61.69 | 156 |
| 61.71 | 130 |
| 61.73 | 125 |
| 61.75 | 155 |
| 61.77 | 148 |
| 61.79 | 169 |
| 61.81 | 128 |
| 61.83 | 130 |
| 61.85 | 140 |
| 61.87 | 142 |
| 61.89 | 134 |
| 61.91 | 144 |
| 61.93 | 126 |
| 61.95 | 129 |
| 61.97 | 136 |
| 61.99 | 129 |
| 62.01 | 135 |
| 62.03 | 142 |
| 62.05 | 119 |
| 62.07 | 127 |
| 62.09 | 119 |
| 62.11 | 107 |
| 62.13 | 110 |
| 62.15 | 94 |
| 62.17 | 122 |
| 62.19 | 140 |
| 62.21 | 141 |
| 62.23 | 132 |
| 62.25 | 117 |
| 62.27 | 112 |
| 62.29 | 123 |
| 62.31 | 113 |
| 62.33 | 129 |
| 62.35 | 98 |
| 62.37 | 127 |
| 62.39 | 113 |
| 62.41 | 99 |
| 62.43 | 118 |
| 62.45 | 128 |
| 62.47 | 102 |
| 62.49 | 108 |
| 62.51 | 106 |
| 62.53 | 116 |
| 62.55 | 93 |
| 62.57 | 101 |
| 62.59 | 132 |
| 62.61 | 139 |
| 62.63 | 115 |
| 62.65 | 128 |
| 62.67 | 129 |
| 62.69 | 117 |
| 62.71 | 105 |
| 62.73 | 123 |
| 62.75 | 105 |
| 62.77 | 98 |
| 62.79 | 117 |
| 62.81 | 104 |
| 62.83 | 111 |
| 62.85 | 122 |
| 62.87 | 104 |
| 62.89 | 99 |
| 62.91 | 123 |
| 62.93 | 108 |
| 62.95 | 112 |
| 62.97 | 109 |
| 62.99 | 125 |
| 63.01 | 102 |
| 63.03 | 102 |
| 63.05 | 98 |
| 63.07 | 111 |
| 63.09 | 116 |
| 63.11 | 104 |
| 63.13 | 123 |
| 63.15 | 106 |
| 63.17 | 91 |
| 63.19 | 81 |
| 63.21 | 106 |
| 63.23 | 123 |
| 63.25 | 111 |
| 63.27 | 114 |
| 63.29 | 104 |
| 63.31 | 88 |
| 63.33 | 110 |
| 63.35 | 103 |
| 63.37 | 99 |
| 63.39 | 100 |
| 63.41 | 106 |
| 63.43 | 101 |
| 63.45 | 100 |
| 63.47 | 104 |
| 63.49 | 116 |
| 63.51 | 104 |
| 63.53 | 111 |
| 63.55 | 116 |
| 63.57 | 98 |
| 63.59 | 80 |
| 63.61 | 112 |
| 63.63 | 101 |
| 63.65 | 114 |
| 63.67 | 88 |
| 63.69 | 95 |
| 63.71 | 97 |
| 63.73 | 82 |
| 63.75 | 100 |
| 63.77 | 80 |
| 63.79 | 86 |
| 63.81 | 95 |
| 63.83 | 92 |
| 63.85 | 91 |
| 63.87 | 91 |
| 63.89 | 85 |
| 63.91 | 93 |
| 63.93 | 96 |
| 63.95 | 95 |
| 63.97 | 108 |
| 63.99 | 97 |
| 64.01 | 102 |
| 64.03 | 112 |
| 64.05 | 87 |
| 64.07 | 93 |
| 64.09 | 97 |
| 64.11 | 113 |
| 64.13 | 96 |
| 64.15 | 92 |
| 64.17 | 115 |
| 64.19 | 87 |
| 64.21 | 76 |
| 64.23 | 110 |
| 64.25 | 100 |
| 64.27 | 101 |
| 64.29 | 89 |
| 64.31 | 96 |
| 64.33 | 98 |
| 64.35 | 116 |
| 64.37 | 83 |
| 64.39 | 92 |
| 64.41 | 94 |
| 64.43 | 98 |
| 64.45 | 79 |
| 64.47 | 85 |
| 64.49 | 73 |
| 64.51 | 93 |
| 64.53 | 94 |
| 64.55 | 96 |
| 64.57 | 94 |
| 64.59 | 84 |
| 64.61 | 89 |
| 64.63 | 89 |
| 64.65 | 91 |
| 64.67 | 85 |
| 64.69 | 112 |
| 64.71 | 101 |
| 64.73 | 65 |
| 64.75 | 101 |
| 64.77 | 94 |
| 64.79 | 83 |
| 64.81 | 96 |
| 64.83 | 99 |
| 64.85 | 85 |
| 64.87 | 81 |
| 64.89 | 68 |
| 64.91 | 84 |
| 64.93 | 88 |
| 64.95 | 97 |
| 64.97 | 88 |
| 64.99 | 81 |
| 65.01 | 88 |
| 65.03 | 76 |
| 65.05 | 83 |
| 65.07 | 100 |
| 65.09 | 99 |
| 65.11 | 94 |
| 65.13 | 77 |
| 65.15 | 84 |
| 65.17 | 97 |
| 65.19 | 70 |
| 65.21 | 73 |
| 65.23 | 81 |
| 65.25 | 82 |
| 65.27 | 82 |
| 65.29 | 100 |
| 65.31 | 95 |
| 65.33 | 87 |
| 65.35 | 97 |
| 65.37 | 74 |
| 65.39 | 88 |
| 65.41 | 93 |
| 65.43 | 88 |
| 65.45 | 90 |
| 65.47 | 97 |
| 65.49 | 82 |
| 65.51 | 87 |
| 65.53 | 77 |
| 65.55 | 89 |
| 65.57 | 73 |
| 65.59 | 78 |
| 65.61 | 72 |
| 65.63 | 87 |
| 65.65 | 92 |
| 65.67 | 88 |
| 65.69 | 75 |
| 65.71 | 91 |
| 65.73 | 89 |
| 65.75 | 66 |
| 65.77 | 88 |
| 65.79 | 69 |
| 65.81 | 93 |
| 65.83 | 92 |
| 65.85 | 98 |
| 65.87 | 94 |
| 65.89 | 97 |
| 65.91 | 87 |
| 65.93 | 106 |
| 65.95 | 110 |
| 65.97 | 92 |
| 65.99 | 79 |
| 66.01 | 102 |
| 66.03 | 96 |
| 66.05 | 128 |
| 66.07 | 119 |
| 66.09 | 186 |
| 66.11 | 189 |
| 66.13 | 250 |
| 66.15 | 238 |
| 66.17 | 223 |
| 66.19 | 184 |
| 66.21 | 164 |
| 66.23 | 140 |
| 66.25 | 163 |
| 66.27 | 155 |
| 66.29 | 169 |
| 66.31 | 131 |
| 66.33 | 148 |
| 66.35 | 159 |
| 66.37 | 154 |
| 66.39 | 128 |
| 66.41 | 113 |
| 66.43 | 106 |
| 66.45 | 88 |
| 66.47 | 94 |
| 66.49 | 102 |
| 66.51 | 87 |
| 66.53 | 84 |
| 66.55 | 82 |
| 66.57 | 73 |
| 66.59 | 89 |
| 66.61 | 76 |
| 66.63 | 86 |
| 66.65 | 70 |
| 66.67 | 84 |
| 66.69 | 77 |
| 66.71 | 69 |
| 66.73 | 72 |
| 66.75 | 69 |
| 66.77 | 72 |
| 66.79 | 84 |
| 66.81 | 71 |
| 66.83 | 78 |
| 66.85 | 82 |
| 66.87 | 70 |
| 66.89 | 83 |
| 66.91 | 71 |
| 66.93 | 84 |
| 66.95 | 83 |
| 66.97 | 88 |
| 66.99 | 84 |
| 67.01 | 90 |
| 67.03 | 71 |
| 67.05 | 92 |
| 67.07 | 91 |
| 67.09 | 78 |
| 67.11 | 79 |
| 67.13 | 71 |
| 67.15 | 92 |
| 67.17 | 70 |
| 67.19 | 89 |
| 67.21 | 79 |
| 67.23 | 67 |
| 67.25 | 82 |
| 67.27 | 93 |
| 67.29 | 74 |
| 67.31 | 83 |
| 67.33 | 75 |
| 67.35 | 85 |
| 67.37 | 74 |
| 67.39 | 81 |
| 67.41 | 69 |
| 67.43 | 84 |
| 67.45 | 66 |
| 67.47 | 96 |
| 67.49 | 82 |
| 67.51 | 98 |
| 67.53 | 81 |
| 67.55 | 91 |
| 67.57 | 91 |
| 67.59 | 77 |
| 67.61 | 99 |
| 67.63 | 80 |
| 67.65 | 92 |
| 67.67 | 104 |
| 67.69 | 95 |
| 67.71 | 130 |
| 67.73 | 123 |
| 67.75 | 141 |
| 67.77 | 210 |
| 67.79 | 220 |
| 67.81 | 283 |
| 67.83 | 325 |
| 67.85 | 326 |
| 67.87 | 313 |
| 67.89 | 268 |
| 67.91 | 223 |
| 67.93 | 210 |
| 67.95 | 171 |
| 67.97 | 184 |
| 67.99 | 177 |
| 68.01 | 188 |
| 68.03 | 160 |
| 68.05 | 185 |
| 68.07 | 160 |
| 68.09 | 134 |
| 68.11 | 147 |
| 68.13 | 131 |
| 68.15 | 101 |
| 68.17 | 105 |
| 68.19 | 99 |
| 68.21 | 68 |
| 68.23 | 84 |
| 68.25 | 88 |
| 68.27 | 99 |
| 68.29 | 93 |
| 68.31 | 81 |
| 68.33 | 76 |
| 68.35 | 88 |
| 68.37 | 87 |
| 68.39 | 90 |
| 68.41 | 84 |
| 68.43 | 86 |
| 68.45 | 81 |
| 68.47 | 64 |
| 68.49 | 82 |
| 68.51 | 80 |
| 68.53 | 82 |
| 68.55 | 80 |
| 68.57 | 81 |
| 68.59 | 90 |
| 68.61 | 83 |
| 68.63 | 70 |
| 68.65 | 72 |
| 68.67 | 91 |
| 68.69 | 73 |
| 68.71 | 74 |
| 68.73 | 88 |
| 68.75 | 84 |
| 68.77 | 74 |
| 68.79 | 74 |
| 68.81 | 91 |
| 68.83 | 75 |
| 68.85 | 66 |
| 68.87 | 78 |
| 68.89 | 63 |
| 68.91 | 81 |
| 68.93 | 78 |
| 68.95 | 63 |
| 68.97 | 94 |
| 68.99 | 61 |
| 69.01 | 80 |
| 69.03 | 70 |
| 69.05 | 78 |
| 69.07 | 82 |
| 69.09 | 77 |
| 69.11 | 88 |
| 69.13 | 85 |
| 69.15 | 86 |
| 69.17 | 70 |
| 69.19 | 79 |
| 69.21 | 84 |
| 69.23 | 94 |
| 69.25 | 82 |
| 69.27 | 71 |
| 69.29 | 90 |
| 69.31 | 77 |
| 69.33 | 91 |
| 69.35 | 88 |
| 69.37 | 79 |
| 69.39 | 83 |
| 69.41 | 70 |
| 69.43 | 70 |
| 69.45 | 74 |
| 69.47 | 80 |
| 69.49 | 68 |
| 69.51 | 81 |
| 69.53 | 74 |
| 69.55 | 82 |
| 69.57 | 69 |
| 69.59 | 69 |
| 69.61 | 89 |
| 69.63 | 96 |
| 69.65 | 74 |
| 69.67 | 66 |
| 69.69 | 78 |
| 69.71 | 81 |
| 69.73 | 65 |
| 69.75 | 75 |
| 69.77 | 68 |
| 69.79 | 73 |
| 69.81 | 91 |
| 69.83 | 71 |
| 69.85 | 69 |
| 69.87 | 76 |
| 69.89 | 76 |
| 69.91 | 58 |
| 69.93 | 84 |
| 69.95 | 81 |
| 69.97 | 74 |
| 69.99 | 80 |
| 70.01 | 90 |
| 70.03 | 100 |
| 70.05 | 69 |
| 70.07 | 69 |
| 70.09 | 85 |
| 70.11 | 79 |
| 70.13 | 94 |
| 70.15 | 100 |
| 70.17 | 71 |
| 70.19 | 82 |
| 70.21 | 73 |
| 70.23 | 89 |
| 70.25 | 82 |
| 70.27 | 85 |
| 70.29 | 78 |
| 70.31 | 86 |
| 70.33 | 92 |
| 70.35 | 82 |
| 70.37 | 96 |
| 70.39 | 79 |
| 70.41 | 68 |
| 70.43 | 88 |
| 70.45 | 79 |
| 70.47 | 87 |
| 70.49 | 77 |
| 70.51 | 93 |
| 70.53 | 89 |
| 70.55 | 82 |
| 70.57 | 90 |
| 70.59 | 80 |
| 70.61 | 81 |
| 70.63 | 73 |
| 70.65 | 77 |
| 70.67 | 68 |
| 70.69 | 72 |
| 70.71 | 75 |
| 70.73 | 77 |
| 70.75 | 94 |
| 70.77 | 82 |
| 70.79 | 76 |
| 70.81 | 68 |
| 70.83 | 79 |
| 70.85 | 86 |
| 70.87 | 71 |
| 70.89 | 71 |
| 70.91 | 63 |
| 70.93 | 82 |
| 70.95 | 68 |
| 70.97 | 67 |
| 70.99 | 79 |
| 71.01 | 85 |
| 71.03 | 74 |
| 71.05 | 72 |
| 71.07 | 78 |
| 71.09 | 81 |
| 71.11 | 67 |
| 71.13 | 78 |
| 71.15 | 74 |
| 71.17 | 69 |
| 71.19 | 61 |
| 71.21 | 74 |
| 71.23 | 79 |
| 71.25 | 82 |
| 71.27 | 80 |
| 71.29 | 76 |
| 71.31 | 66 |
| 71.33 | 82 |
| 71.35 | 98 |
| 71.37 | 71 |
| 71.39 | 79 |
| 71.41 | 87 |
| 71.43 | 92 |
| 71.45 | 88 |
| 71.47 | 74 |
| 71.49 | 85 |
| 71.51 | 77 |
| 71.53 | 76 |
| 71.55 | 79 |
| 71.57 | 73 |
| 71.59 | 76 |
| 71.61 | 85 |
| 71.63 | 73 |
| 71.65 | 65 |
| 71.67 | 72 |
| 71.69 | 77 |
| 71.71 | 86 |
| 71.73 | 67 |
| 71.75 | 89 |
| 71.77 | 59 |
| 71.79 | 59 |
| 71.81 | 70 |
| 71.83 | 73 |
| 71.85 | 79 |
| 71.87 | 76 |
| 71.89 | 83 |
| 71.91 | 87 |
| 71.93 | 69 |
| 71.95 | 76 |
| 71.97 | 78 |
| 71.99 | 83 |
| 72.01 | 78 |
| 72.03 | 62 |
| 72.05 | 83 |
| 72.07 | 75 |
| 72.09 | 76 |
| 72.11 | 83 |
| 72.13 | 97 |
| 72.15 | 72 |
| 72.17 | 68 |
| 72.19 | 70 |
| 72.21 | 66 |
| 72.23 | 77 |
| 72.25 | 86 |
| 72.27 | 75 |
| 72.29 | 71 |
| 72.31 | 92 |
| 72.33 | 79 |
| 72.35 | 71 |
| 72.37 | 69 |
| 72.39 | 70 |
| 72.41 | 75 |
| 72.43 | 65 |
| 72.45 | 78 |
| 72.47 | 73 |
| 72.49 | 73 |
| 72.51 | 66 |
| 72.53 | 80 |
| 72.55 | 83 |
| 72.57 | 80 |
| 72.59 | 73 |
| 72.61 | 79 |
| 72.63 | 70 |
| 72.65 | 75 |
| 72.67 | 66 |
| 72.69 | 70 |
| 72.71 | 73 |
| 72.73 | 79 |
| 72.75 | 66 |
| 72.77 | 80 |
| 72.79 | 73 |
| 72.81 | 82 |
| 72.83 | 70 |
| 72.85 | 67 |
| 72.87 | 67 |
| 72.89 | 78 |
| 72.91 | 86 |
| 72.93 | 58 |
| 72.95 | 77 |
| 72.97 | 76 |
| 72.99 | 70 |
| 73.01 | 74 |
| 73.03 | 67 |
| 73.05 | 81 |
| 73.07 | 71 |
| 73.09 | 75 |
| 73.11 | 58 |
| 73.13 | 74 |
| 73.15 | 73 |
| 73.17 | 57 |
| 73.19 | 70 |
| 73.21 | 64 |
| 73.23 | 77 |
| 73.25 | 66 |
| 73.27 | 65 |
| 73.29 | 76 |
| 73.31 | 79 |
| 73.33 | 72 |
| 73.35 | 69 |
| 73.37 | 68 |
| 73.39 | 65 |
| 73.41 | 68 |
| 73.43 | 77 |
| 73.45 | 76 |
| 73.47 | 57 |
| 73.49 | 74 |
| 73.51 | 85 |
| 73.53 | 69 |
| 73.55 | 84 |
| 73.57 | 75 |
| 73.59 | 78 |
| 73.61 | 84 |
| 73.63 | 72 |
| 73.65 | 81 |
| 73.67 | 76 |
| 73.69 | 78 |
| 73.71 | 89 |
| 73.73 | 65 |
| 73.75 | 82 |
| 73.77 | 63 |
| 73.79 | 62 |
| 73.81 | 69 |
| 73.83 | 74 |
| 73.85 | 74 |
| 73.87 | 77 |
| 73.89 | 89 |
| 73.91 | 80 |
| 73.93 | 72 |
| 73.95 | 84 |
| 73.97 | 74 |
| 73.99 | 84 |
| 74.01 | 73 |
| 74.03 | 79 |
| 74.05 | 69 |
| 74.07 | 78 |
| 74.09 | 66 |
| 74.11 | 91 |
| 74.13 | 78 |
| 74.15 | 73 |
| 74.17 | 66 |
| 74.19 | 80 |
| 74.21 | 85 |
| 74.23 | 82 |
| 74.25 | 70 |
| 74.27 | 51 |
| 74.29 | 85 |
| 74.31 | 77 |
| 74.33 | 72 |
| 74.35 | 71 |
| 74.37 | 74 |
| 74.39 | 79 |
| 74.41 | 71 |
| 74.43 | 82 |
| 74.45 | 78 |
| 74.47 | 76 |
| 74.49 | 74 |
| 74.51 | 68 |
| 74.53 | 76 |
| 74.55 | 61 |
| 74.57 | 77 |
| 74.59 | 76 |
| 74.61 | 77 |
| 74.63 | 80 |
| 74.65 | 72 |
| 74.67 | 84 |
| 74.69 | 80 |
| 74.71 | 70 |
| 74.73 | 77 |
| 74.75 | 79 |
| 74.77 | 77 |
| 74.79 | 70 |
| 74.81 | 80 |
| 74.83 | 54 |
| 74.85 | 66 |
| 74.87 | 77 |
| 74.89 | 68 |
| 74.91 | 70 |
| 74.93 | 69 |
| 74.95 | 71 |
| 74.97 | 86 |
| 74.99 | 84 |
| 75.01 | 62 |
| 75.03 | 68 |
| 75.05 | 68 |
| 75.07 | 73 |
| 75.09 | 80 |
| 75.11 | 83 |
| 75.13 | 74 |
| 75.15 | 74 |
| 75.17 | 64 |
| 75.19 | 73 |
| 75.21 | 85 |
| 75.23 | 75 |
| 75.25 | 73 |
| 75.27 | 86 |
| 75.29 | 87 |
| 75.31 | 66 |
| 75.33 | 78 |
| 75.35 | 86 |
| 75.37 | 86 |
| 75.39 | 67 |
| 75.41 | 67 |
| 75.43 | 65 |
| 75.45 | 74 |
| 75.47 | 75 |
| 75.49 | 66 |
| 75.51 | 70 |
| 75.53 | 79 |
| 75.55 | 75 |
| 75.57 | 61 |
| 75.59 | 75 |
| 75.61 | 66 |
| 75.63 | 70 |
| 75.65 | 73 |
| 75.67 | 79 |
| 75.69 | 59 |
| 75.71 | 60 |
| 75.73 | 64 |
| 75.75 | 69 |
| 75.77 | 80 |
| 75.79 | 68 |
| 75.81 | 75 |
| 75.83 | 68 |
| 75.85 | 65 |
| 75.87 | 79 |
| 75.89 | 78 |
| 75.91 | 75 |
| 75.93 | 76 |
| 75.95 | 78 |
| 75.97 | 98 |
| 75.99 | 65 |
| 76.01 | 67 |
| 76.03 | 71 |
| 76.05 | 61 |
| 76.07 | 71 |
| 76.09 | 79 |
| 76.11 | 82 |
| 76.13 | 82 |
| 76.15 | 77 |
| 76.17 | 87 |
| 76.19 | 84 |
| 76.21 | 66 |
| 76.23 | 86 |
| 76.25 | 73 |
| 76.27 | 91 |
| 76.29 | 94 |
| 76.31 | 112 |
| 76.33 | 78 |
| 76.35 | 83 |
| 76.37 | 97 |
| 76.39 | 84 |
| 76.41 | 98 |
| 76.43 | 120 |
| 76.45 | 114 |
| 76.47 | 151 |
| 76.49 | 160 |
| 76.51 | 183 |
| 76.53 | 160 |
| 76.55 | 133 |
| 76.57 | 145 |
| 76.59 | 135 |
| 76.61 | 114 |
| 76.63 | 105 |
| 76.65 | 116 |
| 76.67 | 128 |
| 76.69 | 114 |
| 76.71 | 118 |
| 76.73 | 118 |
| 76.75 | 127 |
| 76.77 | 152 |
| 76.79 | 155 |
| 76.81 | 118 |
| 76.83 | 173 |
| 76.85 | 145 |
| 76.87 | 166 |
| 76.89 | 184 |
| 76.91 | 174 |
| 76.93 | 165 |
| 76.95 | 177 |
| 76.97 | 171 |
| 76.99 | 170 |
| 77.01 | 187 |
| 77.03 | 182 |
| 77.05 | 225 |
| 77.07 | 220 |
| 77.09 | 255 |
| 77.11 | 278 |
| 77.13 | 313 |
| 77.15 | 332 |
| 77.17 | 397 |
| 77.19 | 473 |
| 77.21 | 524 |
| 77.23 | 580 |
| 77.25 | 701 |
| 77.27 | 749 |
| 77.29 | 856 |
| 77.31 | 937 |
| 77.33 | 1084 |
| 77.35 | 1171 |
| 77.37 | 1240 |
| 77.39 | 1379 |
| 77.41 | 1395 |
| 77.43 | 1464 |
| 77.45 | 1367 |
| 77.47 | 1374 |
| 77.49 | 1245 |
| 77.51 | 1205 |
| 77.53 | 1091 |
| 77.55 | 1113 |
| 77.57 | 1020 |
| 77.59 | 957 |
| 77.61 | 957 |
| 77.63 | 870 |
| 77.65 | 823 |
| 77.67 | 732 |
| 77.69 | 713 |
| 77.71 | 656 |
| 77.73 | 590 |
| 77.75 | 550 |
| 77.77 | 444 |
| 77.79 | 412 |
| 77.81 | 366 |
| 77.83 | 344 |
| 77.85 | 291 |
| 77.87 | 267 |
| 77.89 | 272 |
| 77.91 | 246 |
| 77.93 | 233 |
| 77.95 | 218 |
| 77.97 | 200 |
| 77.99 | 191 |
| 78.01 | 189 |
| 78.03 | 199 |
| 78.05 | 196 |
| 78.07 | 174 |
| 78.09 | 157 |
| 78.11 | 175 |
| 78.13 | 146 |
| 78.15 | 148 |
| 78.17 | 154 |
| 78.19 | 139 |
| 78.21 | 161 |
| 78.23 | 152 |
| 78.25 | 157 |
| 78.27 | 137 |
| 78.29 | 132 |
| 78.31 | 129 |
| 78.33 | 137 |
| 78.35 | 120 |
| 78.37 | 123 |
| 78.39 | 124 |
| 78.41 | 122 |
| 78.43 | 125 |
| 78.45 | 134 |
| 78.47 | 113 |
| 78.49 | 128 |
| 78.51 | 112 |
| 78.53 | 125 |
| 78.55 | 134 |
| 78.57 | 111 |
| 78.59 | 113 |
| 78.61 | 108 |
| 78.63 | 111 |
| 78.65 | 110 |
| 78.67 | 122 |
| 78.69 | 118 |
| 78.71 | 106 |
| 78.73 | 103 |
| 78.75 | 123 |
| 78.77 | 103 |
| 78.79 | 103 |
| 78.81 | 103 |
| 78.83 | 103 |
| 78.85 | 107 |
| 78.87 | 131 |
| 78.89 | 112 |
| 78.91 | 122 |
| 78.93 | 93 |
| 78.95 | 121 |
| 78.97 | 119 |
| 78.99 | 104 |
| 79.01 | 83 |
| 79.03 | 94 |
| 79.05 | 91 |
| 79.07 | 114 |
| 79.09 | 113 |
| 79.11 | 124 |
| 79.13 | 94 |
| 79.15 | 93 |
| 79.17 | 89 |
| 79.19 | 103 |
| 79.21 | 111 |
| 79.23 | 96 |
| 79.25 | 109 |
| 79.27 | 95 |
| 79.29 | 108 |
| 79.31 | 120 |
| 79.33 | 91 |
| 79.35 | 103 |
| 79.37 | 99 |
| 79.39 | 114 |
| 79.41 | 103 |
| 79.43 | 100 |
| 79.45 | 101 |
| 79.47 | 103 |
| 79.49 | 92 |
| 79.51 | 126 |
| 79.53 | 86 |
| 79.55 | 98 |
| 79.57 | 99 |
| 79.59 | 94 |
| 79.61 | 124 |
| 79.63 | 85 |
| 79.65 | 104 |
| 79.67 | 96 |
| 79.69 | 88 |
| 79.71 | 116 |
| 79.73 | 105 |
| 79.75 | 118 |
| 79.77 | 121 |
| 79.79 | 106 |
| 79.81 | 107 |
| 79.83 | 98 |
| 79.85 | 107 |
| 79.87 | 104 |
| 79.89 | 111 |
| 79.91 | 110 |
| 79.93 | 112 |
| 79.95 | 90 |
| 79.97 | 108 |
| 79.99 | 120 |
| 80.01 | 108 |
| 80.03 | 110 |
| 80.05 | 98 |
| 80.07 | 121 |
| 80.09 | 105 |
| 80.11 | 114 |
| 80.13 | 118 |
| 80.15 | 110 |
| 80.17 | 105 |
| 80.19 | 115 |
| 80.21 | 130 |
| 80.23 | 110 |
| 80.25 | 116 |
| 80.27 | 130 |
| 80.29 | 134 |
| 80.31 | 147 |
| 80.33 | 125 |
| 80.35 | 143 |
| 80.37 | 117 |
| 80.39 | 144 |
| 80.41 | 168 |
| 80.43 | 141 |
| 80.45 | 126 |
| 80.47 | 124 |
| 80.49 | 128 |
| 80.51 | 113 |
| 80.53 | 103 |
| 80.55 | 143 |
| 80.57 | 123 |
| 80.59 | 135 |
| 80.61 | 119 |
| 80.63 | 142 |
| 80.65 | 126 |
| 80.67 | 125 |
| 80.69 | 114 |
| 80.71 | 120 |
| 80.73 | 107 |
| 80.75 | 115 |
| 80.77 | 103 |
| 80.79 | 105 |
| 80.81 | 116 |
| 80.83 | 112 |
| 80.85 | 104 |
| 80.87 | 128 |
| 80.89 | 103 |
| 80.91 | 133 |
| 80.93 | 129 |
| 80.95 | 136 |
| 80.97 | 119 |
| 80.99 | 133 |
| 81.01 | 125 |
| 81.03 | 132 |
| 81.05 | 99 |
| 81.07 | 125 |
| 81.09 | 126 |
| 81.11 | 135 |
| 81.13 | 126 |
| 81.15 | 139 |
| 81.17 | 131 |
| 81.19 | 128 |
| 81.21 | 126 |
| 81.23 | 141 |
| 81.25 | 112 |
| 81.27 | 145 |
| 81.29 | 116 |
| 81.31 | 139 |
| 81.33 | 140 |
| 81.35 | 134 |
| 81.37 | 152 |
| 81.39 | 138 |
| 81.41 | 142 |
| 81.43 | 136 |
| 81.45 | 141 |
| 81.47 | 120 |
| 81.49 | 124 |
| 81.51 | 164 |
| 81.53 | 138 |
| 81.55 | 139 |
| 81.57 | 158 |
| 81.59 | 149 |
| 81.61 | 142 |
| 81.63 | 123 |
| 81.65 | 159 |
| 81.67 | 157 |
| 81.69 | 161 |
| 81.71 | 161 |
| 81.73 | 139 |
| 81.75 | 143 |
| 81.77 | 161 |
| 81.79 | 144 |
| 81.81 | 151 |
| 81.83 | 170 |
| 81.85 | 158 |
| 81.87 | 172 |
| 81.89 | 140 |
| 81.91 | 170 |
| 81.93 | 143 |
| 81.95 | 159 |
| 81.97 | 191 |
| 81.99 | 148 |
| 82.01 | 180 |
| 82.03 | 162 |
| 82.05 | 197 |
| 82.07 | 170 |
| 82.09 | 199 |
| 82.11 | 186 |
| 82.13 | 180 |
| 82.15 | 192 |
| 82.17 | 189 |
| 82.19 | 208 |
| 82.21 | 207 |
| 82.23 | 196 |
| 82.25 | 208 |
| 82.27 | 213 |
| 82.29 | 203 |
| 82.31 | 203 |
| 82.33 | 194 |
| 82.35 | 205 |
| 82.37 | 198 |
| 82.39 | 222 |
| 82.41 | 212 |
| 82.43 | 211 |
| 82.45 | 222 |
| 82.47 | 236 |
| 82.49 | 240 |
| 82.51 | 269 |
| 82.53 | 229 |
| 82.55 | 259 |
| 82.57 | 247 |
| 82.59 | 268 |
| 82.61 | 268 |
| 82.63 | 262 |
| 82.65 | 248 |
| 82.67 | 265 |
| 82.69 | 319 |
| 82.71 | 309 |
| 82.73 | 291 |
| 82.75 | 329 |
| 82.77 | 325 |
| 82.79 | 306 |
| 82.81 | 338 |
| 82.83 | 340 |
| 82.85 | 342 |
| 82.87 | 390 |
| 82.89 | 378 |
| 82.91 | 390 |
| 82.93 | 378 |
| 82.95 | 378 |
| 82.97 | 423 |
| 82.99 | 466 |
| 83.01 | 440 |
| 83.03 | 433 |
| 83.05 | 450 |
| 83.07 | 473 |
| 83.09 | 476 |
| 83.11 | 498 |
| 83.13 | 454 |
| 83.15 | 462 |
| 83.17 | 543 |
| 83.19 | 493 |
| 83.21 | 541 |
| 83.23 | 572 |
| 83.25 | 568 |
| 83.27 | 592 |
| 83.29 | 581 |
| 83.31 | 601 |
| 83.33 | 621 |
| 83.35 | 639 |
| 83.37 | 623 |
| 83.39 | 595 |
| 83.41 | 661 |
| 83.43 | 673 |
| 83.45 | 640 |
| 83.47 | 695 |
| 83.49 | 646 |
| 83.51 | 652 |
| 83.53 | 646 |
| 83.55 | 688 |
| 83.57 | 609 |
| 83.59 | 637 |
| 83.61 | 666 |
| 83.63 | 667 |
| 83.65 | 616 |
| 83.67 | 654 |
| 83.69 | 580 |
| 83.71 | 609 |
| 83.73 | 638 |
| 83.75 | 622 |
| 83.77 | 603 |
| 83.79 | 576 |
| 83.81 | 619 |
| 83.83 | 577 |
| 83.85 | 555 |
| 83.87 | 583 |
| 83.89 | 544 |
| 83.91 | 518 |
| 83.93 | 505 |
| 83.95 | 487 |
| 83.97 | 468 |
| 83.99 | 511 |
| 84.01 | 509 |
| 84.03 | 441 |
| 84.05 | 504 |
| 84.07 | 498 |
| 84.09 | 451 |
| 84.11 | 394 |
| 84.13 | 445 |
| 84.15 | 383 |
| 84.17 | 396 |
| 84.19 | 351 |
| 84.21 | 353 |
| 84.23 | 336 |
| 84.25 | 332 |
| 84.27 | 330 |
| 84.29 | 298 |
| 84.31 | 333 |
| 84.33 | 345 |
| 84.35 | 299 |
| 84.37 | 323 |
| 84.39 | 275 |
| 84.41 | 315 |
| 84.43 | 254 |
| 84.45 | 270 |
| 84.47 | 251 |
| 84.49 | 297 |
| 84.51 | 249 |
| 84.53 | 262 |
| 84.55 | 224 |
| 84.57 | 262 |
| 84.59 | 267 |
| 84.61 | 241 |
| 84.63 | 242 |
| 84.65 | 225 |
| 84.67 | 238 |
| 84.69 | 207 |
| 84.71 | 223 |
| 84.73 | 231 |
| 84.75 | 248 |
| 84.77 | 225 |
| 84.79 | 209 |
| 84.81 | 220 |
| 84.83 | 204 |
| 84.85 | 223 |
| 84.87 | 211 |
| 84.89 | 216 |
| 84.91 | 198 |
| 84.93 | 179 |
| 84.95 | 182 |
| 84.97 | 226 |
| 84.99 | 191 |
| 85.01 | 202 |
| 85.03 | 201 |
| 85.05 | 200 |
| 85.07 | 212 |
| 85.09 | 211 |
| 85.11 | 186 |
| 85.13 | 195 |
| 85.15 | 177 |
| 85.17 | 193 |
| 85.19 | 166 |
| 85.21 | 179 |
| 85.23 | 166 |
| 85.25 | 182 |
| 85.27 | 151 |
| 85.29 | 174 |
| 85.31 | 169 |
| 85.33 | 176 |
| 85.35 | 231 |
| 85.37 | 154 |
| 85.39 | 180 |
| 85.41 | 165 |
| 85.43 | 190 |
| 85.45 | 178 |
| 85.47 | 176 |
| 85.49 | 184 |
| 85.51 | 171 |
| 85.53 | 192 |
| 85.55 | 161 |
| 85.57 | 165 |
| 85.59 | 158 |
| 85.61 | 185 |
| 85.63 | 157 |
| 85.65 | 168 |
| 85.67 | 172 |
| 85.69 | 165 |
| 85.71 | 169 |
| 85.73 | 166 |
| 85.75 | 191 |
| 85.77 | 187 |
| 85.79 | 176 |
| 85.81 | 175 |
| 85.83 | 164 |
| 85.85 | 167 |
| 85.87 | 178 |
| 85.89 | 176 |
| 85.91 | 211 |
| 85.93 | 201 |
| 85.95 | 189 |
| 85.97 | 179 |
| 85.99 | 206 |
| 86.01 | 174 |
| 86.03 | 203 |
| 86.05 | 217 |
| 86.07 | 220 |
| 86.09 | 217 |
| 86.11 | 194 |
| 86.13 | 191 |
| 86.15 | 204 |
| 86.17 | 196 |
| 86.19 | 218 |
| 86.21 | 214 |
| 86.23 | 213 |
| 86.25 | 206 |
| 86.27 | 209 |
| 86.29 | 221 |
| 86.31 | 197 |
| 86.33 | 205 |
| 86.35 | 179 |
| 86.37 | 218 |
| 86.39 | 224 |
| 86.41 | 199 |
| 86.43 | 223 |
| 86.45 | 220 |
| 86.47 | 249 |
| 86.49 | 211 |
| 86.51 | 217 |
| 86.53 | 254 |
| 86.55 | 212 |
| 86.57 | 252 |
| 86.59 | 241 |
| 86.61 | 228 |
| 86.63 | 246 |
| 86.65 | 252 |
| 86.67 | 249 |
| 86.69 | 223 |
| 86.71 | 261 |
| 86.73 | 230 |
| 86.75 | 223 |
| 86.77 | 207 |
| 86.79 | 241 |
| 86.81 | 239 |
| 86.83 | 235 |
| 86.85 | 228 |
| 86.87 | 205 |
| 86.89 | 225 |
| 86.91 | 215 |
| 86.93 | 196 |
| 86.95 | 190 |
| 86.97 | 202 |
| 86.99 | 214 |
| 87.01 | 168 |
| 87.03 | 186 |
| 87.05 | 199 |
| 87.07 | 152 |
| 87.09 | 167 |
| 87.11 | 158 |
| 87.13 | 158 |
| 87.15 | 169 |
| 87.17 | 153 |
| 87.19 | 161 |
| 87.21 | 138 |
| 87.23 | 156 |
| 87.25 | 128 |
| 87.27 | 114 |
| 87.29 | 116 |
| 87.31 | 126 |
| 87.33 | 105 |
| 87.35 | 124 |
| 87.37 | 114 |
| 87.39 | 109 |
| 87.41 | 119 |
| 87.43 | 94 |
| 87.45 | 90 |
| 87.47 | 123 |
| 87.49 | 110 |
| 87.51 | 83 |
| 87.53 | 109 |
| 87.55 | 106 |
| 87.57 | 105 |
| 87.59 | 85 |
| 87.61 | 100 |
| 87.63 | 94 |
| 87.65 | 108 |
| 87.67 | 84 |
| 87.69 | 109 |
| 87.71 | 111 |
| 87.73 | 99 |
| 87.75 | 100 |
| 87.77 | 89 |
| 87.79 | 88 |
| 87.81 | 100 |
| 87.83 | 111 |
| 87.85 | 108 |
| 87.87 | 110 |
| 87.89 | 77 |
| 87.91 | 101 |
| 87.93 | 88 |
| 87.95 | 91 |
| 87.97 | 77 |
| 87.99 | 88 |
| 88.01 | 77 |
| 88.03 | 84 |
| 88.05 | 87 |
| 88.07 | 69 |
| 88.09 | 94 |
| 88.11 | 78 |
| 88.13 | 74 |
| 88.15 | 92 |
| 88.17 | 100 |
| 88.19 | 99 |
| 88.21 | 81 |
| 88.23 | 96 |
| 88.25 | 79 |
| 88.27 | 77 |
| 88.29 | 81 |
| 88.31 | 84 |
| 88.33 | 79 |
| 88.35 | 92 |
| 88.37 | 82 |
| 88.39 | 92 |
| 88.41 | 81 |
| 88.43 | 76 |
| 88.45 | 75 |
| 88.47 | 89 |
| 88.49 | 66 |
| 88.51 | 74 |
| 88.53 | 82 |
| 88.55 | 80 |
| 88.57 | 93 |
| 88.59 | 102 |
| 88.61 | 115 |
| 88.63 | 116 |
| 88.65 | 128 |
| 88.67 | 133 |
| 88.69 | 142 |
| 88.71 | 108 |
| 88.73 | 101 |
| 88.75 | 95 |
| 88.77 | 106 |
| 88.79 | 83 |
| 88.81 | 86 |
| 88.83 | 70 |
| 88.85 | 73 |
| 88.87 | 74 |
| 88.89 | 98 |
| 88.91 | 82 |
| 88.93 | 107 |
| 88.95 | 96 |
| 88.97 | 88 |
| 88.99 | 76 |
| 89.01 | 71 |
| 89.03 | 80 |
| 89.05 | 73 |
| 89.07 | 72 |
| 89.09 | 74 |
| 89.11 | 83 |
| 89.13 | 94 |
| 89.15 | 67 |
| 89.17 | 61 |
| 89.19 | 81 |
| 89.21 | 71 |
| 89.23 | 102 |
| 89.25 | 76 |
| 89.27 | 69 |
| 89.29 | 57 |
| 89.31 | 62 |
| 89.33 | 68 |
| 89.35 | 60 |
| 89.37 | 62 |
| 89.39 | 86 |
| 89.41 | 61 |
| 89.43 | 65 |
| 89.45 | 85 |
| 89.47 | 65 |
| 89.49 | 70 |
| 89.51 | 65 |
| 89.53 | 63 |
| 89.55 | 73 |
| 89.57 | 59 |
| 89.59 | 71 |
| 89.61 | 68 |
| 89.63 | 76 |
| 89.65 | 60 |
| 89.67 | 70 |
| 89.69 | 60 |
| 89.71 | 68 |
| 89.73 | 86 |
| 89.75 | 54 |
| 89.77 | 58 |
| 89.79 | 61 |
| 89.81 | 59 |
| 89.83 | 74 |
| 89.85 | 71 |
| 89.87 | 84 |
| 89.89 | 64 |
| 89.91 | 76 |
| 89.93 | 81 |
| 89.95 | 68 |
| 89.97 | 76 |
| 89.99 | 60 |